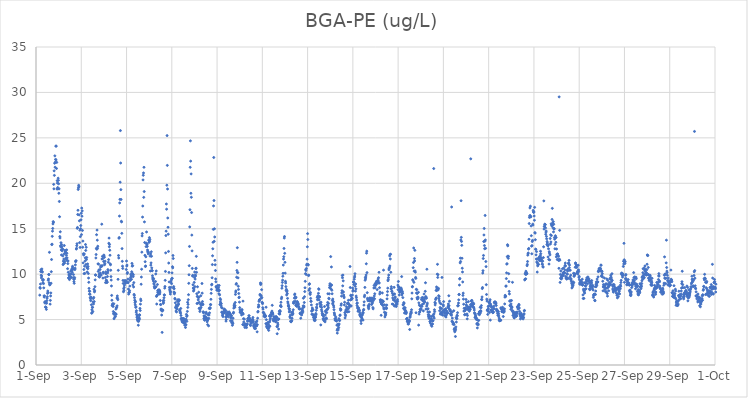
| Category | BGA-PE (ug/L) |
|---|---|
| 44440.166666666664 | 7.69 |
| 44440.177083333336 | 8.53 |
| 44440.1875 | 8.44 |
| 44440.197916666664 | 8.91 |
| 44440.208333333336 | 10.28 |
| 44440.21875 | 10.49 |
| 44440.229166666664 | 9.88 |
| 44440.239583333336 | 9.59 |
| 44440.25 | 9.79 |
| 44440.260416666664 | 10.57 |
| 44440.270833333336 | 10.29 |
| 44440.28125 | 10.23 |
| 44440.291666666664 | 9.36 |
| 44440.302083333336 | 9.04 |
| 44440.3125 | 9.31 |
| 44440.322916666664 | 9.4 |
| 44440.333333333336 | 8.96 |
| 44440.34375 | 8.49 |
| 44440.354166666664 | 7.6 |
| 44440.364583333336 | 7.47 |
| 44440.375 | 7.6 |
| 44440.385416666664 | 6.91 |
| 44440.395833333336 | 6.82 |
| 44440.40625 | 6.97 |
| 44440.416666666664 | 6.38 |
| 44440.427083333336 | 6.36 |
| 44440.4375 | 6.83 |
| 44440.447916666664 | 6.34 |
| 44440.458333333336 | 6.12 |
| 44440.46875 | 6.8 |
| 44440.479166666664 | 7.08 |
| 44440.489583333336 | 7.35 |
| 44440.5 | 7.52 |
| 44440.510416666664 | 7.88 |
| 44440.520833333336 | 8.14 |
| 44440.53125 | 7.98 |
| 44440.541666666664 | 9.32 |
| 44440.552083333336 | 9.47 |
| 44440.5625 | 9.96 |
| 44440.572916666664 | 9.95 |
| 44440.583333333336 | 9.05 |
| 44440.59375 | 12.4 |
| 44440.604166666664 | 8.84 |
| 44440.614583333336 | 8.82 |
| 44440.625 | 6.7 |
| 44440.635416666664 | 7.11 |
| 44440.645833333336 | 7.6 |
| 44440.65625 | 7.93 |
| 44440.666666666664 | 9 |
| 44440.677083333336 | 10.27 |
| 44440.6875 | 11.61 |
| 44440.697916666664 | 13.25 |
| 44440.708333333336 | 13.3 |
| 44440.71875 | 14.16 |
| 44440.729166666664 | 14.73 |
| 44440.739583333336 | 15.03 |
| 44440.75 | 15.53 |
| 44440.760416666664 | 15.78 |
| 44440.770833333336 | 15.7 |
| 44440.78125 | 19.88 |
| 44440.791666666664 | 19.39 |
| 44440.802083333336 | 21.37 |
| 44440.8125 | 20.87 |
| 44440.822916666664 | 22.21 |
| 44440.833333333336 | 23.02 |
| 44440.84375 | 21.77 |
| 44440.854166666664 | 22.32 |
| 44440.864583333336 | 22.63 |
| 44440.875 | 24.09 |
| 44440.885416666664 | 22.57 |
| 44440.895833333336 | 24.09 |
| 44440.90625 | 21.63 |
| 44440.916666666664 | 22.3 |
| 44440.927083333336 | 19.37 |
| 44440.9375 | 20.29 |
| 44440.947916666664 | 20.02 |
| 44440.958333333336 | 19.53 |
| 44440.96875 | 19.38 |
| 44440.979166666664 | 20.56 |
| 44440.989583333336 | 20.32 |
| 44441.0 | 19.95 |
| 44441.010416666664 | 18.9 |
| 44441.020833333336 | 19.39 |
| 44441.03125 | 18 |
| 44441.041666666664 | 16.32 |
| 44441.052083333336 | 14.14 |
| 44441.0625 | 13.98 |
| 44441.072916666664 | 14.66 |
| 44441.083333333336 | 13.12 |
| 44441.09375 | 13 |
| 44441.104166666664 | 13.46 |
| 44441.114583333336 | 12.66 |
| 44441.125 | 12.11 |
| 44441.135416666664 | 13.25 |
| 44441.145833333336 | 13.01 |
| 44441.15625 | 12.57 |
| 44441.166666666664 | 12.74 |
| 44441.177083333336 | 12.76 |
| 44441.1875 | 12.01 |
| 44441.197916666664 | 11.05 |
| 44441.208333333336 | 11.43 |
| 44441.21875 | 11.17 |
| 44441.229166666664 | 11.66 |
| 44441.239583333336 | 12.23 |
| 44441.25 | 13.15 |
| 44441.260416666664 | 11.21 |
| 44441.270833333336 | 11.4 |
| 44441.28125 | 12.63 |
| 44441.291666666664 | 12.46 |
| 44441.302083333336 | 12.45 |
| 44441.3125 | 12.3 |
| 44441.322916666664 | 11.78 |
| 44441.333333333336 | 11.62 |
| 44441.34375 | 12.07 |
| 44441.354166666664 | 12.67 |
| 44441.364583333336 | 12.3 |
| 44441.375 | 11.79 |
| 44441.385416666664 | 11.48 |
| 44441.395833333336 | 10.6 |
| 44441.40625 | 11.16 |
| 44441.416666666664 | 11.45 |
| 44441.427083333336 | 10.2 |
| 44441.4375 | 9.57 |
| 44441.447916666664 | 9.61 |
| 44441.458333333336 | 9.93 |
| 44441.46875 | 9.83 |
| 44441.479166666664 | 9.4 |
| 44441.489583333336 | 9.99 |
| 44441.5 | 9.75 |
| 44441.510416666664 | 9.69 |
| 44441.520833333336 | 9.63 |
| 44441.53125 | 10.33 |
| 44441.541666666664 | 10 |
| 44441.552083333336 | 10.02 |
| 44441.5625 | 9.63 |
| 44441.572916666664 | 10.46 |
| 44441.583333333336 | 10.38 |
| 44441.59375 | 10.61 |
| 44441.604166666664 | 10.21 |
| 44441.614583333336 | 10.86 |
| 44441.625 | 10.71 |
| 44441.635416666664 | 10.54 |
| 44441.645833333336 | 9.62 |
| 44441.65625 | 9.95 |
| 44441.666666666664 | 9.44 |
| 44441.677083333336 | 9.18 |
| 44441.6875 | 8.99 |
| 44441.697916666664 | 9.47 |
| 44441.708333333336 | 9.62 |
| 44441.71875 | 10.5 |
| 44441.729166666664 | 10.66 |
| 44441.739583333336 | 11.02 |
| 44441.75 | 11.37 |
| 44441.760416666664 | 11.46 |
| 44441.770833333336 | 11.47 |
| 44441.78125 | 12.76 |
| 44441.791666666664 | 12.84 |
| 44441.802083333336 | 13.13 |
| 44441.8125 | 13.35 |
| 44441.822916666664 | 15.04 |
| 44441.833333333336 | 15.14 |
| 44441.84375 | 16.57 |
| 44441.854166666664 | 17.03 |
| 44441.864583333336 | 19.32 |
| 44441.875 | 19.5 |
| 44441.885416666664 | 19.78 |
| 44441.895833333336 | 19.62 |
| 44441.90625 | 16.52 |
| 44441.916666666664 | 15.87 |
| 44441.927083333336 | 13.47 |
| 44441.9375 | 14.84 |
| 44441.947916666664 | 12.94 |
| 44441.958333333336 | 14.13 |
| 44441.96875 | 15 |
| 44441.979166666664 | 15.35 |
| 44441.989583333336 | 15.98 |
| 44442.0 | 16.7 |
| 44442.010416666664 | 14.35 |
| 44442.020833333336 | 17.27 |
| 44442.03125 | 16.38 |
| 44442.041666666664 | 16.96 |
| 44442.052083333336 | 14.81 |
| 44442.0625 | 12.96 |
| 44442.072916666664 | 13.64 |
| 44442.083333333336 | 11.24 |
| 44442.09375 | 12.25 |
| 44442.104166666664 | 12.11 |
| 44442.114583333336 | 10.51 |
| 44442.125 | 10.06 |
| 44442.135416666664 | 12.22 |
| 44442.145833333336 | 10.88 |
| 44442.15625 | 10.08 |
| 44442.166666666664 | 11.44 |
| 44442.177083333336 | 11.8 |
| 44442.1875 | 13.26 |
| 44442.197916666664 | 12.61 |
| 44442.208333333336 | 11.06 |
| 44442.21875 | 12.96 |
| 44442.229166666664 | 11.61 |
| 44442.239583333336 | 11.83 |
| 44442.25 | 10.71 |
| 44442.260416666664 | 10.24 |
| 44442.270833333336 | 10.79 |
| 44442.28125 | 11.12 |
| 44442.291666666664 | 10.6 |
| 44442.302083333336 | 10.84 |
| 44442.3125 | 10.07 |
| 44442.322916666664 | 9.57 |
| 44442.333333333336 | 9.1 |
| 44442.34375 | 8.43 |
| 44442.354166666664 | 8.13 |
| 44442.364583333336 | 7.8 |
| 44442.375 | 8.11 |
| 44442.385416666664 | 7.79 |
| 44442.395833333336 | 7.43 |
| 44442.40625 | 7.3 |
| 44442.416666666664 | 7.08 |
| 44442.427083333336 | 7.48 |
| 44442.4375 | 7.36 |
| 44442.447916666664 | 6.63 |
| 44442.458333333336 | 5.7 |
| 44442.46875 | 6.08 |
| 44442.479166666664 | 5.75 |
| 44442.489583333336 | 6.35 |
| 44442.5 | 6.34 |
| 44442.510416666664 | 5.89 |
| 44442.520833333336 | 6.94 |
| 44442.53125 | 7.31 |
| 44442.541666666664 | 6.72 |
| 44442.552083333336 | 7.44 |
| 44442.5625 | 8.34 |
| 44442.572916666664 | 6.98 |
| 44442.583333333336 | 8.05 |
| 44442.59375 | 8.16 |
| 44442.604166666664 | 8.62 |
| 44442.614583333336 | 9.37 |
| 44442.625 | 9.91 |
| 44442.635416666664 | 9.89 |
| 44442.645833333336 | 11.78 |
| 44442.65625 | 12.16 |
| 44442.666666666664 | 12.84 |
| 44442.677083333336 | 14.34 |
| 44442.6875 | 12.74 |
| 44442.697916666664 | 14.85 |
| 44442.708333333336 | 13.74 |
| 44442.71875 | 12.85 |
| 44442.729166666664 | 13.07 |
| 44442.739583333336 | 11.13 |
| 44442.75 | 10.3 |
| 44442.760416666664 | 11.11 |
| 44442.770833333336 | 9.75 |
| 44442.78125 | 10.47 |
| 44442.791666666664 | 10.01 |
| 44442.802083333336 | 9.67 |
| 44442.8125 | 9.75 |
| 44442.822916666664 | 9.96 |
| 44442.833333333336 | 10.51 |
| 44442.84375 | 10.12 |
| 44442.854166666664 | 10.78 |
| 44442.864583333336 | 10.91 |
| 44442.875 | 10.91 |
| 44442.885416666664 | 9.91 |
| 44442.895833333336 | 10.85 |
| 44442.90625 | 15.5 |
| 44442.916666666664 | 11.67 |
| 44442.927083333336 | 10.93 |
| 44442.9375 | 11.96 |
| 44442.947916666664 | 11.71 |
| 44442.958333333336 | 9.57 |
| 44442.96875 | 10.21 |
| 44442.979166666664 | 10.12 |
| 44442.989583333336 | 11.39 |
| 44443.0 | 12.1 |
| 44443.010416666664 | 11.99 |
| 44443.020833333336 | 11.85 |
| 44443.03125 | 11.04 |
| 44443.041666666664 | 11.17 |
| 44443.052083333336 | 11.43 |
| 44443.0625 | 9.63 |
| 44443.072916666664 | 9.07 |
| 44443.083333333336 | 10.25 |
| 44443.09375 | 10.04 |
| 44443.104166666664 | 9.32 |
| 44443.114583333336 | 9.32 |
| 44443.125 | 9.08 |
| 44443.135416666664 | 9.15 |
| 44443.145833333336 | 9.11 |
| 44443.15625 | 9.74 |
| 44443.166666666664 | 10.14 |
| 44443.177083333336 | 10.5 |
| 44443.1875 | 10.35 |
| 44443.197916666664 | 11.31 |
| 44443.208333333336 | 11.6 |
| 44443.21875 | 13.4 |
| 44443.229166666664 | 13.97 |
| 44443.239583333336 | 13.01 |
| 44443.25 | 13.26 |
| 44443.260416666664 | 12.63 |
| 44443.270833333336 | 12.08 |
| 44443.28125 | 11.12 |
| 44443.291666666664 | 11.03 |
| 44443.302083333336 | 10.43 |
| 44443.3125 | 9.73 |
| 44443.322916666664 | 9.35 |
| 44443.333333333336 | 8.7 |
| 44443.34375 | 7.66 |
| 44443.354166666664 | 7.13 |
| 44443.364583333336 | 6.58 |
| 44443.375 | 6.56 |
| 44443.385416666664 | 6.74 |
| 44443.395833333336 | 6.49 |
| 44443.40625 | 6.45 |
| 44443.416666666664 | 5.88 |
| 44443.427083333336 | 5.65 |
| 44443.4375 | 6.74 |
| 44443.447916666664 | 5.09 |
| 44443.458333333336 | 5.57 |
| 44443.46875 | 5.75 |
| 44443.479166666664 | 5.26 |
| 44443.489583333336 | 5.61 |
| 44443.5 | 5.66 |
| 44443.510416666664 | 5.35 |
| 44443.520833333336 | 5.63 |
| 44443.53125 | 6.15 |
| 44443.541666666664 | 5.59 |
| 44443.552083333336 | 6.31 |
| 44443.5625 | 6.33 |
| 44443.572916666664 | 7.37 |
| 44443.583333333336 | 6.51 |
| 44443.59375 | 7.6 |
| 44443.604166666664 | 7.35 |
| 44443.614583333336 | 7.19 |
| 44443.625 | 9.43 |
| 44443.635416666664 | 10.42 |
| 44443.645833333336 | 12.05 |
| 44443.65625 | 11.78 |
| 44443.666666666664 | 13.95 |
| 44443.677083333336 | 14.03 |
| 44443.6875 | 16.39 |
| 44443.697916666664 | 17.84 |
| 44443.708333333336 | 18.23 |
| 44443.71875 | 20.12 |
| 44443.729166666664 | 25.8 |
| 44443.739583333336 | 22.23 |
| 44443.75 | 19.3 |
| 44443.760416666664 | 18.22 |
| 44443.770833333336 | 15.82 |
| 44443.78125 | 15.75 |
| 44443.791666666664 | 14.49 |
| 44443.802083333336 | 12.81 |
| 44443.8125 | 11.41 |
| 44443.822916666664 | 10.88 |
| 44443.833333333336 | 10.63 |
| 44443.84375 | 9.31 |
| 44443.854166666664 | 8.98 |
| 44443.864583333336 | 8.06 |
| 44443.875 | 8.39 |
| 44443.885416666664 | 8.19 |
| 44443.895833333336 | 8.56 |
| 44443.90625 | 8.79 |
| 44443.916666666664 | 9.22 |
| 44443.927083333336 | 9.27 |
| 44443.9375 | 9.28 |
| 44443.947916666664 | 9.03 |
| 44443.958333333336 | 9.01 |
| 44443.96875 | 9.21 |
| 44443.979166666664 | 9.27 |
| 44443.989583333336 | 10.51 |
| 44444.0 | 11.44 |
| 44444.010416666664 | 10.89 |
| 44444.020833333336 | 11 |
| 44444.03125 | 10.07 |
| 44444.041666666664 | 10.19 |
| 44444.052083333336 | 9.1 |
| 44444.0625 | 9.46 |
| 44444.072916666664 | 9.05 |
| 44444.083333333336 | 8.36 |
| 44444.09375 | 7.8 |
| 44444.104166666664 | 7.97 |
| 44444.114583333336 | 7.95 |
| 44444.125 | 8.01 |
| 44444.135416666664 | 8.18 |
| 44444.145833333336 | 8.68 |
| 44444.15625 | 9.29 |
| 44444.166666666664 | 9.41 |
| 44444.177083333336 | 9.6 |
| 44444.1875 | 10 |
| 44444.197916666664 | 9.79 |
| 44444.208333333336 | 9.79 |
| 44444.21875 | 9.43 |
| 44444.229166666664 | 10.26 |
| 44444.239583333336 | 11.18 |
| 44444.25 | 10.88 |
| 44444.260416666664 | 10.08 |
| 44444.270833333336 | 10.94 |
| 44444.28125 | 8.81 |
| 44444.291666666664 | 9.73 |
| 44444.302083333336 | 9.93 |
| 44444.3125 | 8.59 |
| 44444.322916666664 | 9.07 |
| 44444.333333333336 | 7.77 |
| 44444.34375 | 7.66 |
| 44444.354166666664 | 7.41 |
| 44444.364583333336 | 7.13 |
| 44444.375 | 6.86 |
| 44444.385416666664 | 6.62 |
| 44444.395833333336 | 6.98 |
| 44444.40625 | 6.34 |
| 44444.416666666664 | 6.41 |
| 44444.427083333336 | 5.82 |
| 44444.4375 | 5.98 |
| 44444.447916666664 | 5.58 |
| 44444.458333333336 | 5.26 |
| 44444.46875 | 5.42 |
| 44444.479166666664 | 5.04 |
| 44444.489583333336 | 4.93 |
| 44444.5 | 4.84 |
| 44444.510416666664 | 5.03 |
| 44444.520833333336 | 4.38 |
| 44444.53125 | 4.8 |
| 44444.541666666664 | 4.93 |
| 44444.552083333336 | 5.25 |
| 44444.5625 | 5.52 |
| 44444.572916666664 | 5.07 |
| 44444.583333333336 | 5.5 |
| 44444.59375 | 6.23 |
| 44444.604166666664 | 6 |
| 44444.614583333336 | 6.7 |
| 44444.625 | 7.25 |
| 44444.635416666664 | 7.08 |
| 44444.645833333336 | 8.89 |
| 44444.65625 | 9.68 |
| 44444.666666666664 | 10.54 |
| 44444.677083333336 | 12.42 |
| 44444.6875 | 14.21 |
| 44444.697916666664 | 14.47 |
| 44444.708333333336 | 16.28 |
| 44444.71875 | 17.5 |
| 44444.729166666664 | 20.37 |
| 44444.739583333336 | 20.88 |
| 44444.75 | 21.14 |
| 44444.760416666664 | 18.45 |
| 44444.770833333336 | 21.76 |
| 44444.78125 | 19.09 |
| 44444.791666666664 | 15.75 |
| 44444.802083333336 | 13.48 |
| 44444.8125 | 12.07 |
| 44444.822916666664 | 11.37 |
| 44444.833333333336 | 10.84 |
| 44444.84375 | 10.9 |
| 44444.854166666664 | 11.91 |
| 44444.864583333336 | 13.03 |
| 44444.875 | 13.41 |
| 44444.885416666664 | 14.64 |
| 44444.895833333336 | 13.31 |
| 44444.90625 | 13.23 |
| 44444.916666666664 | 13.05 |
| 44444.927083333336 | 12.66 |
| 44444.9375 | 12.44 |
| 44444.947916666664 | 12.49 |
| 44444.958333333336 | 12.23 |
| 44444.96875 | 12.38 |
| 44444.979166666664 | 13.75 |
| 44444.989583333336 | 13.49 |
| 44445.0 | 13.69 |
| 44445.010416666664 | 14.02 |
| 44445.020833333336 | 13.6 |
| 44445.03125 | 13.83 |
| 44445.041666666664 | 11.98 |
| 44445.052083333336 | 10.35 |
| 44445.0625 | 12.22 |
| 44445.072916666664 | 10.99 |
| 44445.083333333336 | 11.24 |
| 44445.09375 | 12.46 |
| 44445.104166666664 | 11.97 |
| 44445.114583333336 | 10.69 |
| 44445.125 | 10.39 |
| 44445.135416666664 | 10.37 |
| 44445.145833333336 | 9.82 |
| 44445.15625 | 9.59 |
| 44445.166666666664 | 9.4 |
| 44445.177083333336 | 9.54 |
| 44445.1875 | 9.24 |
| 44445.197916666664 | 9.49 |
| 44445.208333333336 | 8.99 |
| 44445.21875 | 8.89 |
| 44445.229166666664 | 8.64 |
| 44445.239583333336 | 8.47 |
| 44445.25 | 8.58 |
| 44445.260416666664 | 8.5 |
| 44445.270833333336 | 8.56 |
| 44445.28125 | 9.19 |
| 44445.291666666664 | 10.02 |
| 44445.302083333336 | 8.62 |
| 44445.3125 | 10.35 |
| 44445.322916666664 | 7.55 |
| 44445.333333333336 | 6.71 |
| 44445.34375 | 7.63 |
| 44445.354166666664 | 7.7 |
| 44445.364583333336 | 8.86 |
| 44445.375 | 8.17 |
| 44445.385416666664 | 7.98 |
| 44445.395833333336 | 8.01 |
| 44445.40625 | 8.26 |
| 44445.416666666664 | 8.02 |
| 44445.427083333336 | 7.82 |
| 44445.4375 | 8.25 |
| 44445.447916666664 | 8.24 |
| 44445.458333333336 | 8.18 |
| 44445.46875 | 7.82 |
| 44445.479166666664 | 8.03 |
| 44445.489583333336 | 7.1 |
| 44445.5 | 6.66 |
| 44445.510416666664 | 6.65 |
| 44445.520833333336 | 6.15 |
| 44445.53125 | 6.04 |
| 44445.541666666664 | 6.13 |
| 44445.552083333336 | 5.5 |
| 44445.5625 | 5.96 |
| 44445.572916666664 | 3.59 |
| 44445.583333333336 | 5.95 |
| 44445.59375 | 6.04 |
| 44445.604166666664 | 6.04 |
| 44445.614583333336 | 7.08 |
| 44445.625 | 6.78 |
| 44445.635416666664 | 6.91 |
| 44445.645833333336 | 7.11 |
| 44445.65625 | 7.4 |
| 44445.666666666664 | 7.72 |
| 44445.677083333336 | 7.69 |
| 44445.6875 | 8.46 |
| 44445.697916666664 | 8.64 |
| 44445.708333333336 | 9.32 |
| 44445.71875 | 10.3 |
| 44445.729166666664 | 12.34 |
| 44445.739583333336 | 14.25 |
| 44445.75 | 14.73 |
| 44445.760416666664 | 17.72 |
| 44445.770833333336 | 17.15 |
| 44445.78125 | 19.79 |
| 44445.791666666664 | 25.25 |
| 44445.802083333336 | 21.97 |
| 44445.8125 | 19.37 |
| 44445.822916666664 | 16.18 |
| 44445.833333333336 | 15.16 |
| 44445.84375 | 14.4 |
| 44445.854166666664 | 12.5 |
| 44445.864583333336 | 11.22 |
| 44445.875 | 10.19 |
| 44445.885416666664 | 9.14 |
| 44445.895833333336 | 8.54 |
| 44445.90625 | 8.34 |
| 44445.916666666664 | 8.18 |
| 44445.927083333336 | 8.04 |
| 44445.9375 | 7.81 |
| 44445.947916666664 | 8.04 |
| 44445.958333333336 | 8.54 |
| 44445.96875 | 9.13 |
| 44445.979166666664 | 9.35 |
| 44445.989583333336 | 8.95 |
| 44446.0 | 9.52 |
| 44446.010416666664 | 10.14 |
| 44446.020833333336 | 9.54 |
| 44446.03125 | 10.82 |
| 44446.041666666664 | 10.69 |
| 44446.052083333336 | 12.05 |
| 44446.0625 | 11.72 |
| 44446.072916666664 | 8.48 |
| 44446.083333333336 | 8.63 |
| 44446.09375 | 8.03 |
| 44446.104166666664 | 8.4 |
| 44446.114583333336 | 7.83 |
| 44446.125 | 7.95 |
| 44446.135416666664 | 7.33 |
| 44446.145833333336 | 7.25 |
| 44446.15625 | 6.85 |
| 44446.166666666664 | 6.31 |
| 44446.177083333336 | 6.39 |
| 44446.1875 | 5.94 |
| 44446.197916666664 | 6.59 |
| 44446.208333333336 | 5.84 |
| 44446.21875 | 6.18 |
| 44446.229166666664 | 6.19 |
| 44446.239583333336 | 6.43 |
| 44446.25 | 7.03 |
| 44446.260416666664 | 7.17 |
| 44446.270833333336 | 6.59 |
| 44446.28125 | 6.66 |
| 44446.291666666664 | 6.96 |
| 44446.302083333336 | 6.71 |
| 44446.3125 | 7.19 |
| 44446.322916666664 | 7.14 |
| 44446.333333333336 | 7.1 |
| 44446.34375 | 6.06 |
| 44446.354166666664 | 5.98 |
| 44446.364583333336 | 5.85 |
| 44446.375 | 5.81 |
| 44446.385416666664 | 5.69 |
| 44446.395833333336 | 6.22 |
| 44446.40625 | 5.45 |
| 44446.416666666664 | 5.12 |
| 44446.427083333336 | 5.11 |
| 44446.4375 | 4.96 |
| 44446.447916666664 | 4.84 |
| 44446.458333333336 | 5.07 |
| 44446.46875 | 4.71 |
| 44446.479166666664 | 4.83 |
| 44446.489583333336 | 5.13 |
| 44446.5 | 4.74 |
| 44446.510416666664 | 4.93 |
| 44446.520833333336 | 5.07 |
| 44446.53125 | 4.65 |
| 44446.541666666664 | 5.09 |
| 44446.552083333336 | 4.66 |
| 44446.5625 | 4.56 |
| 44446.572916666664 | 4.38 |
| 44446.583333333336 | 4.9 |
| 44446.59375 | 4.74 |
| 44446.604166666664 | 4.13 |
| 44446.614583333336 | 4.46 |
| 44446.625 | 4.41 |
| 44446.635416666664 | 5.03 |
| 44446.645833333336 | 5.57 |
| 44446.65625 | 5.34 |
| 44446.666666666664 | 4.81 |
| 44446.677083333336 | 5.42 |
| 44446.6875 | 5.9 |
| 44446.697916666664 | 6.9 |
| 44446.708333333336 | 6.34 |
| 44446.71875 | 6.67 |
| 44446.729166666664 | 7.19 |
| 44446.739583333336 | 7.74 |
| 44446.75 | 8.99 |
| 44446.760416666664 | 9.93 |
| 44446.770833333336 | 10.93 |
| 44446.78125 | 13.05 |
| 44446.791666666664 | 15.2 |
| 44446.802083333336 | 17.09 |
| 44446.8125 | 21.76 |
| 44446.822916666664 | 24.67 |
| 44446.833333333336 | 22.44 |
| 44446.84375 | 18.9 |
| 44446.854166666664 | 21.03 |
| 44446.864583333336 | 18.46 |
| 44446.875 | 16.78 |
| 44446.885416666664 | 14.3 |
| 44446.895833333336 | 12.56 |
| 44446.90625 | 10.63 |
| 44446.916666666664 | 9.79 |
| 44446.927083333336 | 9.87 |
| 44446.9375 | 8.83 |
| 44446.947916666664 | 8.47 |
| 44446.958333333336 | 8.14 |
| 44446.96875 | 8.42 |
| 44446.979166666664 | 8.26 |
| 44446.989583333336 | 9.09 |
| 44447.0 | 9.64 |
| 44447.010416666664 | 10.23 |
| 44447.020833333336 | 8.63 |
| 44447.03125 | 9.46 |
| 44447.041666666664 | 9.91 |
| 44447.052083333336 | 9.8 |
| 44447.0625 | 10.61 |
| 44447.072916666664 | 10.66 |
| 44447.083333333336 | 11.96 |
| 44447.09375 | 10.2 |
| 44447.104166666664 | 7.84 |
| 44447.114583333336 | 6.77 |
| 44447.125 | 7.55 |
| 44447.135416666664 | 8.61 |
| 44447.145833333336 | 7.52 |
| 44447.15625 | 6.81 |
| 44447.166666666664 | 7.17 |
| 44447.177083333336 | 7.41 |
| 44447.1875 | 8.01 |
| 44447.197916666664 | 7.47 |
| 44447.208333333336 | 6.23 |
| 44447.21875 | 6.9 |
| 44447.229166666664 | 6.25 |
| 44447.239583333336 | 5.89 |
| 44447.25 | 6.07 |
| 44447.260416666664 | 6.26 |
| 44447.270833333336 | 6.66 |
| 44447.28125 | 7.62 |
| 44447.291666666664 | 6.34 |
| 44447.302083333336 | 6.72 |
| 44447.3125 | 6.63 |
| 44447.322916666664 | 6.76 |
| 44447.333333333336 | 8.97 |
| 44447.34375 | 7.91 |
| 44447.354166666664 | 6.98 |
| 44447.364583333336 | 6.64 |
| 44447.375 | 6.69 |
| 44447.385416666664 | 5.86 |
| 44447.395833333336 | 5.77 |
| 44447.40625 | 5.78 |
| 44447.416666666664 | 5.12 |
| 44447.427083333336 | 5.42 |
| 44447.4375 | 5.35 |
| 44447.447916666664 | 4.94 |
| 44447.458333333336 | 4.95 |
| 44447.46875 | 5.25 |
| 44447.479166666664 | 5.19 |
| 44447.489583333336 | 5.04 |
| 44447.5 | 5.32 |
| 44447.510416666664 | 5.66 |
| 44447.520833333336 | 5.8 |
| 44447.53125 | 5.19 |
| 44447.541666666664 | 5.12 |
| 44447.552083333336 | 5.05 |
| 44447.5625 | 4.75 |
| 44447.572916666664 | 4.89 |
| 44447.583333333336 | 4.44 |
| 44447.59375 | 4.99 |
| 44447.604166666664 | 5.57 |
| 44447.614583333336 | 5.53 |
| 44447.625 | 4.31 |
| 44447.635416666664 | 5.13 |
| 44447.645833333336 | 5.5 |
| 44447.65625 | 6.22 |
| 44447.666666666664 | 5.74 |
| 44447.677083333336 | 6.29 |
| 44447.6875 | 6.21 |
| 44447.697916666664 | 6.29 |
| 44447.708333333336 | 6.66 |
| 44447.71875 | 6.64 |
| 44447.729166666664 | 7.23 |
| 44447.739583333336 | 7.89 |
| 44447.75 | 8.32 |
| 44447.760416666664 | 8.82 |
| 44447.770833333336 | 8.89 |
| 44447.78125 | 9.6 |
| 44447.791666666664 | 11.05 |
| 44447.802083333336 | 12.02 |
| 44447.8125 | 12.79 |
| 44447.822916666664 | 13.51 |
| 44447.833333333336 | 14.93 |
| 44447.84375 | 17.51 |
| 44447.854166666664 | 22.84 |
| 44447.864583333336 | 18.1 |
| 44447.875 | 13.61 |
| 44447.885416666664 | 14.99 |
| 44447.895833333336 | 14.09 |
| 44447.90625 | 11.52 |
| 44447.916666666664 | 11.03 |
| 44447.927083333336 | 10.4 |
| 44447.9375 | 9.47 |
| 44447.947916666664 | 9.16 |
| 44447.958333333336 | 8.64 |
| 44447.96875 | 8.54 |
| 44447.979166666664 | 8.61 |
| 44447.989583333336 | 8.24 |
| 44448.0 | 8.25 |
| 44448.010416666664 | 8.4 |
| 44448.020833333336 | 8.41 |
| 44448.03125 | 8.76 |
| 44448.041666666664 | 8.21 |
| 44448.052083333336 | 8.29 |
| 44448.0625 | 8.5 |
| 44448.072916666664 | 8.18 |
| 44448.083333333336 | 7.84 |
| 44448.09375 | 8.75 |
| 44448.104166666664 | 8.21 |
| 44448.114583333336 | 7.72 |
| 44448.125 | 6.66 |
| 44448.135416666664 | 7.31 |
| 44448.145833333336 | 6.94 |
| 44448.15625 | 7.18 |
| 44448.166666666664 | 6.81 |
| 44448.177083333336 | 6.53 |
| 44448.1875 | 6.75 |
| 44448.197916666664 | 6.32 |
| 44448.208333333336 | 5.82 |
| 44448.21875 | 5.8 |
| 44448.229166666664 | 6.27 |
| 44448.239583333336 | 5.47 |
| 44448.25 | 5.61 |
| 44448.260416666664 | 5.33 |
| 44448.270833333336 | 5.69 |
| 44448.28125 | 5.67 |
| 44448.291666666664 | 5.83 |
| 44448.302083333336 | 5.76 |
| 44448.3125 | 5.98 |
| 44448.322916666664 | 6.15 |
| 44448.333333333336 | 6.1 |
| 44448.34375 | 5.75 |
| 44448.354166666664 | 5.83 |
| 44448.364583333336 | 5.95 |
| 44448.375 | 6.01 |
| 44448.385416666664 | 5.28 |
| 44448.395833333336 | 4.83 |
| 44448.40625 | 5.01 |
| 44448.416666666664 | 5.56 |
| 44448.427083333336 | 5.32 |
| 44448.4375 | 5.45 |
| 44448.447916666664 | 5.41 |
| 44448.458333333336 | 5.82 |
| 44448.46875 | 5.69 |
| 44448.479166666664 | 5.76 |
| 44448.489583333336 | 5.67 |
| 44448.5 | 5.59 |
| 44448.510416666664 | 5.3 |
| 44448.520833333336 | 5.67 |
| 44448.53125 | 5.85 |
| 44448.541666666664 | 5.6 |
| 44448.552083333336 | 5.67 |
| 44448.5625 | 5.69 |
| 44448.572916666664 | 5.66 |
| 44448.583333333336 | 5.51 |
| 44448.59375 | 4.86 |
| 44448.604166666664 | 5.18 |
| 44448.614583333336 | 5.47 |
| 44448.625 | 5.29 |
| 44448.635416666664 | 5.43 |
| 44448.645833333336 | 4.65 |
| 44448.65625 | 4.89 |
| 44448.666666666664 | 4.76 |
| 44448.677083333336 | 4.37 |
| 44448.6875 | 4.65 |
| 44448.697916666664 | 4.55 |
| 44448.708333333336 | 5.15 |
| 44448.71875 | 5.7 |
| 44448.729166666664 | 5.8 |
| 44448.739583333336 | 6.26 |
| 44448.75 | 6.51 |
| 44448.760416666664 | 6.7 |
| 44448.770833333336 | 6.42 |
| 44448.78125 | 6.35 |
| 44448.791666666664 | 6.53 |
| 44448.802083333336 | 6.88 |
| 44448.8125 | 7.77 |
| 44448.822916666664 | 8.03 |
| 44448.833333333336 | 8.16 |
| 44448.84375 | 8.88 |
| 44448.854166666664 | 8.97 |
| 44448.864583333336 | 9.66 |
| 44448.875 | 10.4 |
| 44448.885416666664 | 11.3 |
| 44448.895833333336 | 12.91 |
| 44448.90625 | 10.17 |
| 44448.916666666664 | 10.17 |
| 44448.927083333336 | 9.59 |
| 44448.9375 | 8.67 |
| 44448.947916666664 | 8.32 |
| 44448.958333333336 | 7.87 |
| 44448.96875 | 7.41 |
| 44448.979166666664 | 7.47 |
| 44448.989583333336 | 6.92 |
| 44449.0 | 6.31 |
| 44449.010416666664 | 6.07 |
| 44449.020833333336 | 5.79 |
| 44449.03125 | 5.88 |
| 44449.041666666664 | 5.78 |
| 44449.052083333336 | 5.81 |
| 44449.0625 | 5.9 |
| 44449.072916666664 | 5.94 |
| 44449.083333333336 | 5.51 |
| 44449.09375 | 6.03 |
| 44449.104166666664 | 6.1 |
| 44449.114583333336 | 5.76 |
| 44449.125 | 5.68 |
| 44449.135416666664 | 4.45 |
| 44449.145833333336 | 7.03 |
| 44449.15625 | 5.61 |
| 44449.166666666664 | 5.1 |
| 44449.177083333336 | 4.73 |
| 44449.1875 | 4.37 |
| 44449.197916666664 | 4.46 |
| 44449.208333333336 | 5.05 |
| 44449.21875 | 4.4 |
| 44449.229166666664 | 4.13 |
| 44449.239583333336 | 4.53 |
| 44449.25 | 4.45 |
| 44449.260416666664 | 4.46 |
| 44449.270833333336 | 4.4 |
| 44449.28125 | 4.38 |
| 44449.291666666664 | 4.31 |
| 44449.302083333336 | 4.12 |
| 44449.3125 | 4.45 |
| 44449.322916666664 | 4.52 |
| 44449.333333333336 | 4.51 |
| 44449.34375 | 4.83 |
| 44449.354166666664 | 5.1 |
| 44449.364583333336 | 4.9 |
| 44449.375 | 5.06 |
| 44449.385416666664 | 5.18 |
| 44449.395833333336 | 4.85 |
| 44449.40625 | 5.42 |
| 44449.416666666664 | 5.42 |
| 44449.427083333336 | 4.89 |
| 44449.4375 | 5.16 |
| 44449.447916666664 | 5.03 |
| 44449.458333333336 | 4.84 |
| 44449.46875 | 4.43 |
| 44449.479166666664 | 4.34 |
| 44449.489583333336 | 4.62 |
| 44449.5 | 4.75 |
| 44449.510416666664 | 4.89 |
| 44449.520833333336 | 4.68 |
| 44449.53125 | 4.76 |
| 44449.541666666664 | 4.68 |
| 44449.552083333336 | 4.87 |
| 44449.5625 | 5.04 |
| 44449.572916666664 | 4.75 |
| 44449.583333333336 | 5.23 |
| 44449.59375 | 4.94 |
| 44449.604166666664 | 4.77 |
| 44449.614583333336 | 4.35 |
| 44449.625 | 4.21 |
| 44449.635416666664 | 4.47 |
| 44449.645833333336 | 4.43 |
| 44449.65625 | 4.02 |
| 44449.666666666664 | 4.15 |
| 44449.677083333336 | 4.39 |
| 44449.6875 | 4.27 |
| 44449.697916666664 | 4.01 |
| 44449.708333333336 | 4.64 |
| 44449.71875 | 4.32 |
| 44449.729166666664 | 4.35 |
| 44449.739583333336 | 4.75 |
| 44449.75 | 4.3 |
| 44449.760416666664 | 4.84 |
| 44449.770833333336 | 3.65 |
| 44449.78125 | 4.44 |
| 44449.791666666664 | 5.15 |
| 44449.802083333336 | 5.83 |
| 44449.8125 | 5.9 |
| 44449.822916666664 | 6.37 |
| 44449.833333333336 | 6.62 |
| 44449.84375 | 6.46 |
| 44449.854166666664 | 7 |
| 44449.864583333336 | 7.13 |
| 44449.875 | 7.11 |
| 44449.885416666664 | 7.22 |
| 44449.895833333336 | 7.77 |
| 44449.90625 | 7.66 |
| 44449.916666666664 | 9.03 |
| 44449.927083333336 | 8.85 |
| 44449.9375 | 8.95 |
| 44449.947916666664 | 7.64 |
| 44449.958333333336 | 7.37 |
| 44449.96875 | 8.29 |
| 44449.979166666664 | 7.43 |
| 44449.989583333336 | 6.87 |
| 44450.0 | 6.88 |
| 44450.010416666664 | 6.75 |
| 44450.020833333336 | 6.31 |
| 44450.03125 | 6.15 |
| 44450.041666666664 | 5.79 |
| 44450.052083333336 | 5.77 |
| 44450.0625 | 5.75 |
| 44450.072916666664 | 5.39 |
| 44450.083333333336 | 5.37 |
| 44450.09375 | 5.59 |
| 44450.104166666664 | 5.53 |
| 44450.114583333336 | 5.28 |
| 44450.125 | 5.46 |
| 44450.135416666664 | 5.35 |
| 44450.145833333336 | 5.38 |
| 44450.15625 | 4.55 |
| 44450.166666666664 | 6.36 |
| 44450.177083333336 | 4.99 |
| 44450.1875 | 4.2 |
| 44450.197916666664 | 4.39 |
| 44450.208333333336 | 4.57 |
| 44450.21875 | 4.6 |
| 44450.229166666664 | 4.09 |
| 44450.239583333336 | 4.01 |
| 44450.25 | 4.2 |
| 44450.260416666664 | 4.71 |
| 44450.270833333336 | 4.49 |
| 44450.28125 | 3.81 |
| 44450.291666666664 | 4.09 |
| 44450.302083333336 | 4.26 |
| 44450.3125 | 5.38 |
| 44450.322916666664 | 4.75 |
| 44450.333333333336 | 4.27 |
| 44450.34375 | 4.96 |
| 44450.354166666664 | 5.14 |
| 44450.364583333336 | 5.55 |
| 44450.375 | 5.51 |
| 44450.385416666664 | 5.44 |
| 44450.395833333336 | 5.39 |
| 44450.40625 | 5.78 |
| 44450.416666666664 | 5.77 |
| 44450.427083333336 | 5.93 |
| 44450.4375 | 6.57 |
| 44450.447916666664 | 5.66 |
| 44450.458333333336 | 5.72 |
| 44450.46875 | 5.6 |
| 44450.479166666664 | 5.05 |
| 44450.489583333336 | 4.88 |
| 44450.5 | 4.87 |
| 44450.510416666664 | 5.33 |
| 44450.520833333336 | 5.27 |
| 44450.53125 | 4.95 |
| 44450.541666666664 | 5.03 |
| 44450.552083333336 | 5.03 |
| 44450.5625 | 5.05 |
| 44450.572916666664 | 4.8 |
| 44450.583333333336 | 4.82 |
| 44450.59375 | 4.76 |
| 44450.604166666664 | 5.34 |
| 44450.614583333336 | 4.95 |
| 44450.625 | 5.19 |
| 44450.635416666664 | 5.26 |
| 44450.645833333336 | 4.23 |
| 44450.65625 | 3.44 |
| 44450.666666666664 | 4.24 |
| 44450.677083333336 | 4.62 |
| 44450.6875 | 4.42 |
| 44450.697916666664 | 5 |
| 44450.708333333336 | 5.03 |
| 44450.71875 | 3.96 |
| 44450.729166666664 | 5.07 |
| 44450.739583333336 | 5.64 |
| 44450.75 | 5.92 |
| 44450.760416666664 | 5.7 |
| 44450.770833333336 | 5.6 |
| 44450.78125 | 5.99 |
| 44450.791666666664 | 5.88 |
| 44450.802083333336 | 6.49 |
| 44450.8125 | 6.57 |
| 44450.822916666664 | 6.9 |
| 44450.833333333336 | 6.42 |
| 44450.84375 | 7.29 |
| 44450.854166666664 | 7.46 |
| 44450.864583333336 | 8.45 |
| 44450.875 | 8.73 |
| 44450.885416666664 | 9.09 |
| 44450.895833333336 | 9.34 |
| 44450.90625 | 9.77 |
| 44450.916666666664 | 10.09 |
| 44450.927083333336 | 11 |
| 44450.9375 | 11.66 |
| 44450.947916666664 | 11.92 |
| 44450.958333333336 | 12.83 |
| 44450.96875 | 13.97 |
| 44450.979166666664 | 14.14 |
| 44450.989583333336 | 12.29 |
| 44451.0 | 11.3 |
| 44451.010416666664 | 10.11 |
| 44451.020833333336 | 9.21 |
| 44451.03125 | 9.02 |
| 44451.041666666664 | 8.63 |
| 44451.052083333336 | 8.2 |
| 44451.0625 | 8.33 |
| 44451.072916666664 | 7.71 |
| 44451.083333333336 | 8.05 |
| 44451.09375 | 8.16 |
| 44451.104166666664 | 7.85 |
| 44451.114583333336 | 7.33 |
| 44451.125 | 6.95 |
| 44451.135416666664 | 6.81 |
| 44451.145833333336 | 6.5 |
| 44451.15625 | 6.59 |
| 44451.166666666664 | 6.42 |
| 44451.177083333336 | 6.19 |
| 44451.1875 | 5.84 |
| 44451.197916666664 | 6.18 |
| 44451.208333333336 | 5.97 |
| 44451.21875 | 5.32 |
| 44451.229166666664 | 5.2 |
| 44451.239583333336 | 5.49 |
| 44451.25 | 4.83 |
| 44451.260416666664 | 4.79 |
| 44451.270833333336 | 4.75 |
| 44451.28125 | 4.84 |
| 44451.291666666664 | 5.78 |
| 44451.302083333336 | 4.87 |
| 44451.3125 | 5.14 |
| 44451.322916666664 | 5.51 |
| 44451.333333333336 | 5.62 |
| 44451.34375 | 5.83 |
| 44451.354166666664 | 5.63 |
| 44451.364583333336 | 6.08 |
| 44451.375 | 6.81 |
| 44451.385416666664 | 6.94 |
| 44451.395833333336 | 6.81 |
| 44451.40625 | 6.97 |
| 44451.416666666664 | 7.36 |
| 44451.427083333336 | 7.73 |
| 44451.4375 | 7.82 |
| 44451.447916666664 | 7.46 |
| 44451.458333333336 | 7 |
| 44451.46875 | 7.36 |
| 44451.479166666664 | 6.57 |
| 44451.489583333336 | 7.46 |
| 44451.5 | 6.69 |
| 44451.510416666664 | 6.54 |
| 44451.520833333336 | 6.45 |
| 44451.53125 | 6.9 |
| 44451.541666666664 | 6.99 |
| 44451.552083333336 | 6.9 |
| 44451.5625 | 6.85 |
| 44451.572916666664 | 6.59 |
| 44451.583333333336 | 6.61 |
| 44451.59375 | 6.72 |
| 44451.604166666664 | 6.39 |
| 44451.614583333336 | 6.39 |
| 44451.625 | 6.18 |
| 44451.635416666664 | 6.21 |
| 44451.645833333336 | 6.2 |
| 44451.65625 | 6.17 |
| 44451.666666666664 | 5.67 |
| 44451.677083333336 | 5.73 |
| 44451.6875 | 5.63 |
| 44451.697916666664 | 5.15 |
| 44451.708333333336 | 5.61 |
| 44451.71875 | 5.69 |
| 44451.729166666664 | 5.71 |
| 44451.739583333336 | 5.51 |
| 44451.75 | 5.93 |
| 44451.760416666664 | 6.21 |
| 44451.770833333336 | 6.06 |
| 44451.78125 | 5.77 |
| 44451.791666666664 | 5.93 |
| 44451.802083333336 | 6.5 |
| 44451.8125 | 7.35 |
| 44451.822916666664 | 6.35 |
| 44451.833333333336 | 6.5 |
| 44451.84375 | 6.4 |
| 44451.854166666664 | 6.88 |
| 44451.864583333336 | 7.52 |
| 44451.875 | 8.08 |
| 44451.885416666664 | 8.5 |
| 44451.895833333336 | 9.21 |
| 44451.90625 | 10.06 |
| 44451.916666666664 | 10.52 |
| 44451.927083333336 | 10.4 |
| 44451.9375 | 9.96 |
| 44451.947916666664 | 10.62 |
| 44451.958333333336 | 10.99 |
| 44451.96875 | 11.1 |
| 44451.979166666664 | 11.65 |
| 44451.989583333336 | 13.01 |
| 44452.0 | 14.46 |
| 44452.010416666664 | 13.81 |
| 44452.020833333336 | 11.06 |
| 44452.03125 | 11.01 |
| 44452.041666666664 | 9.84 |
| 44452.052083333336 | 9.89 |
| 44452.0625 | 8.22 |
| 44452.072916666664 | 8.87 |
| 44452.083333333336 | 8.95 |
| 44452.09375 | 8.41 |
| 44452.104166666664 | 7.89 |
| 44452.114583333336 | 7.76 |
| 44452.125 | 7.98 |
| 44452.135416666664 | 7.33 |
| 44452.145833333336 | 7 |
| 44452.15625 | 7.02 |
| 44452.166666666664 | 6.61 |
| 44452.177083333336 | 5.94 |
| 44452.1875 | 5.59 |
| 44452.197916666664 | 5.94 |
| 44452.208333333336 | 6.27 |
| 44452.21875 | 6.11 |
| 44452.229166666664 | 5.56 |
| 44452.239583333336 | 6.07 |
| 44452.25 | 5.46 |
| 44452.260416666664 | 5.22 |
| 44452.270833333336 | 5.41 |
| 44452.28125 | 5.51 |
| 44452.291666666664 | 4.97 |
| 44452.302083333336 | 4.89 |
| 44452.3125 | 5.1 |
| 44452.322916666664 | 5.02 |
| 44452.333333333336 | 4.91 |
| 44452.34375 | 5.26 |
| 44452.354166666664 | 5.28 |
| 44452.364583333336 | 5.67 |
| 44452.375 | 5.53 |
| 44452.385416666664 | 6.02 |
| 44452.395833333336 | 6.37 |
| 44452.40625 | 6.27 |
| 44452.416666666664 | 6.66 |
| 44452.427083333336 | 7.44 |
| 44452.4375 | 7.18 |
| 44452.447916666664 | 7.52 |
| 44452.458333333336 | 7.63 |
| 44452.46875 | 7.38 |
| 44452.479166666664 | 7.89 |
| 44452.489583333336 | 8.39 |
| 44452.5 | 8.33 |
| 44452.510416666664 | 7.16 |
| 44452.520833333336 | 7.55 |
| 44452.53125 | 7.48 |
| 44452.541666666664 | 6.83 |
| 44452.552083333336 | 6.75 |
| 44452.5625 | 6.48 |
| 44452.572916666664 | 6.42 |
| 44452.583333333336 | 4.41 |
| 44452.59375 | 6.91 |
| 44452.604166666664 | 6.61 |
| 44452.614583333336 | 6.07 |
| 44452.625 | 6.33 |
| 44452.635416666664 | 5.89 |
| 44452.645833333336 | 5.69 |
| 44452.65625 | 5.5 |
| 44452.666666666664 | 5.51 |
| 44452.677083333336 | 5.6 |
| 44452.6875 | 5.09 |
| 44452.697916666664 | 5.07 |
| 44452.708333333336 | 5.32 |
| 44452.71875 | 4.91 |
| 44452.729166666664 | 4.88 |
| 44452.739583333336 | 5.05 |
| 44452.75 | 6.44 |
| 44452.760416666664 | 4.91 |
| 44452.770833333336 | 4.75 |
| 44452.78125 | 5.51 |
| 44452.791666666664 | 5.96 |
| 44452.802083333336 | 5.85 |
| 44452.8125 | 5.83 |
| 44452.822916666664 | 5.18 |
| 44452.833333333336 | 5.09 |
| 44452.84375 | 5.76 |
| 44452.854166666664 | 6.13 |
| 44452.864583333336 | 6.61 |
| 44452.875 | 6.11 |
| 44452.885416666664 | 6.89 |
| 44452.895833333336 | 7.84 |
| 44452.90625 | 6.5 |
| 44452.916666666664 | 6.29 |
| 44452.927083333336 | 6.77 |
| 44452.9375 | 7.35 |
| 44452.947916666664 | 7.28 |
| 44452.958333333336 | 7.83 |
| 44452.96875 | 8.53 |
| 44452.979166666664 | 8.78 |
| 44452.989583333336 | 8.95 |
| 44453.0 | 8.46 |
| 44453.010416666664 | 8.66 |
| 44453.020833333336 | 11.93 |
| 44453.03125 | 8.81 |
| 44453.041666666664 | 8.35 |
| 44453.052083333336 | 10.79 |
| 44453.0625 | 8.8 |
| 44453.072916666664 | 8.23 |
| 44453.083333333336 | 7.84 |
| 44453.09375 | 7.11 |
| 44453.104166666664 | 6.73 |
| 44453.114583333336 | 7.26 |
| 44453.125 | 6.84 |
| 44453.135416666664 | 6.99 |
| 44453.145833333336 | 6.55 |
| 44453.15625 | 6.37 |
| 44453.166666666664 | 6.09 |
| 44453.177083333336 | 5.74 |
| 44453.1875 | 5.61 |
| 44453.197916666664 | 5.47 |
| 44453.208333333336 | 5.09 |
| 44453.21875 | 4.94 |
| 44453.229166666664 | 4.92 |
| 44453.239583333336 | 5 |
| 44453.25 | 5.27 |
| 44453.260416666664 | 4.87 |
| 44453.270833333336 | 4.98 |
| 44453.28125 | 4.84 |
| 44453.291666666664 | 4.39 |
| 44453.302083333336 | 3.83 |
| 44453.3125 | 3.51 |
| 44453.322916666664 | 3.96 |
| 44453.333333333336 | 4.36 |
| 44453.34375 | 4.51 |
| 44453.354166666664 | 3.86 |
| 44453.364583333336 | 4.34 |
| 44453.375 | 4.11 |
| 44453.385416666664 | 5.1 |
| 44453.395833333336 | 4.51 |
| 44453.40625 | 4.9 |
| 44453.416666666664 | 4.9 |
| 44453.427083333336 | 5.45 |
| 44453.4375 | 5.51 |
| 44453.447916666664 | 6.2 |
| 44453.458333333336 | 6.02 |
| 44453.46875 | 6.11 |
| 44453.479166666664 | 6.58 |
| 44453.489583333336 | 6.73 |
| 44453.5 | 7.58 |
| 44453.510416666664 | 7.93 |
| 44453.520833333336 | 8.18 |
| 44453.53125 | 9.84 |
| 44453.541666666664 | 9.6 |
| 44453.552083333336 | 8.71 |
| 44453.5625 | 9.9 |
| 44453.572916666664 | 9.26 |
| 44453.583333333336 | 8.04 |
| 44453.59375 | 7.71 |
| 44453.604166666664 | 7.55 |
| 44453.614583333336 | 7.4 |
| 44453.625 | 6.61 |
| 44453.635416666664 | 6.91 |
| 44453.645833333336 | 5.76 |
| 44453.65625 | 5.18 |
| 44453.666666666664 | 5.56 |
| 44453.677083333336 | 5.42 |
| 44453.6875 | 5.95 |
| 44453.697916666664 | 6.08 |
| 44453.708333333336 | 5.91 |
| 44453.71875 | 6.42 |
| 44453.729166666664 | 5.87 |
| 44453.739583333336 | 6.25 |
| 44453.75 | 6.77 |
| 44453.760416666664 | 5.85 |
| 44453.770833333336 | 6.15 |
| 44453.78125 | 6.76 |
| 44453.791666666664 | 6.83 |
| 44453.802083333336 | 7.12 |
| 44453.8125 | 6.23 |
| 44453.822916666664 | 5.87 |
| 44453.833333333336 | 6.68 |
| 44453.84375 | 6.63 |
| 44453.854166666664 | 6.47 |
| 44453.864583333336 | 6.44 |
| 44453.875 | 10.84 |
| 44453.885416666664 | 8.53 |
| 44453.895833333336 | 7.16 |
| 44453.90625 | 7.68 |
| 44453.916666666664 | 7.6 |
| 44453.927083333336 | 6.5 |
| 44453.9375 | 7.21 |
| 44453.947916666664 | 7.36 |
| 44453.958333333336 | 7.28 |
| 44453.96875 | 7.34 |
| 44453.979166666664 | 7.7 |
| 44453.989583333336 | 8.47 |
| 44454.0 | 8.12 |
| 44454.010416666664 | 8.22 |
| 44454.020833333336 | 9.14 |
| 44454.03125 | 9.11 |
| 44454.041666666664 | 8.85 |
| 44454.052083333336 | 9.1 |
| 44454.0625 | 9.44 |
| 44454.072916666664 | 9.66 |
| 44454.083333333336 | 9.79 |
| 44454.09375 | 10.05 |
| 44454.104166666664 | 8.66 |
| 44454.114583333336 | 8.13 |
| 44454.125 | 8.92 |
| 44454.135416666664 | 8.38 |
| 44454.145833333336 | 7.59 |
| 44454.15625 | 7.41 |
| 44454.166666666664 | 7.15 |
| 44454.177083333336 | 6.77 |
| 44454.1875 | 6.53 |
| 44454.197916666664 | 6.83 |
| 44454.208333333336 | 6.26 |
| 44454.21875 | 6.35 |
| 44454.229166666664 | 5.91 |
| 44454.239583333336 | 5.95 |
| 44454.25 | 6.07 |
| 44454.260416666664 | 6.27 |
| 44454.270833333336 | 5.97 |
| 44454.28125 | 5.93 |
| 44454.291666666664 | 6.03 |
| 44454.302083333336 | 5.52 |
| 44454.3125 | 5.72 |
| 44454.322916666664 | 5.42 |
| 44454.333333333336 | 5.53 |
| 44454.34375 | 5.32 |
| 44454.354166666664 | 4.86 |
| 44454.364583333336 | 4.57 |
| 44454.375 | 5.26 |
| 44454.385416666664 | 5.24 |
| 44454.395833333336 | 4.96 |
| 44454.40625 | 5.09 |
| 44454.416666666664 | 5.49 |
| 44454.427083333336 | 5.63 |
| 44454.4375 | 5.79 |
| 44454.447916666664 | 4.94 |
| 44454.458333333336 | 5.73 |
| 44454.46875 | 6.03 |
| 44454.479166666664 | 6.12 |
| 44454.489583333336 | 6.59 |
| 44454.5 | 6.95 |
| 44454.510416666664 | 7.51 |
| 44454.520833333336 | 7.68 |
| 44454.53125 | 8.54 |
| 44454.541666666664 | 9.33 |
| 44454.552083333336 | 9.63 |
| 44454.5625 | 9.48 |
| 44454.572916666664 | 9.69 |
| 44454.583333333336 | 9.91 |
| 44454.59375 | 11.14 |
| 44454.604166666664 | 12.31 |
| 44454.614583333336 | 12.53 |
| 44454.625 | 10.17 |
| 44454.635416666664 | 7.96 |
| 44454.645833333336 | 7.34 |
| 44454.65625 | 7.22 |
| 44454.666666666664 | 7.07 |
| 44454.677083333336 | 6.51 |
| 44454.6875 | 6.33 |
| 44454.697916666664 | 6.19 |
| 44454.708333333336 | 6.46 |
| 44454.71875 | 6.67 |
| 44454.729166666664 | 7.05 |
| 44454.739583333336 | 7.37 |
| 44454.75 | 7.24 |
| 44454.760416666664 | 7.35 |
| 44454.770833333336 | 7.34 |
| 44454.78125 | 7.25 |
| 44454.791666666664 | 7.13 |
| 44454.802083333336 | 7.02 |
| 44454.8125 | 7.12 |
| 44454.822916666664 | 6.65 |
| 44454.833333333336 | 7.1 |
| 44454.84375 | 7.38 |
| 44454.854166666664 | 6.76 |
| 44454.864583333336 | 6.91 |
| 44454.875 | 7.23 |
| 44454.885416666664 | 6.32 |
| 44454.895833333336 | 6.18 |
| 44454.90625 | 7.09 |
| 44454.916666666664 | 7.33 |
| 44454.927083333336 | 8.48 |
| 44454.9375 | 8.76 |
| 44454.947916666664 | 7.6 |
| 44454.958333333336 | 7.29 |
| 44454.96875 | 7.84 |
| 44454.979166666664 | 8.49 |
| 44454.989583333336 | 8.97 |
| 44455.0 | 8.74 |
| 44455.010416666664 | 8.93 |
| 44455.020833333336 | 8.87 |
| 44455.03125 | 8.85 |
| 44455.041666666664 | 9.2 |
| 44455.052083333336 | 9.1 |
| 44455.0625 | 9.18 |
| 44455.072916666664 | 8.3 |
| 44455.083333333336 | 9.18 |
| 44455.09375 | 9.25 |
| 44455.104166666664 | 9.07 |
| 44455.114583333336 | 9.46 |
| 44455.125 | 9.25 |
| 44455.135416666664 | 9.61 |
| 44455.145833333336 | 9.03 |
| 44455.15625 | 10.2 |
| 44455.166666666664 | 9.03 |
| 44455.177083333336 | 8.51 |
| 44455.1875 | 7.82 |
| 44455.197916666664 | 8.03 |
| 44455.208333333336 | 7.17 |
| 44455.21875 | 6.93 |
| 44455.229166666664 | 7.09 |
| 44455.239583333336 | 7.17 |
| 44455.25 | 5.47 |
| 44455.260416666664 | 6.73 |
| 44455.270833333336 | 6.71 |
| 44455.28125 | 6.8 |
| 44455.291666666664 | 7.1 |
| 44455.302083333336 | 7.93 |
| 44455.3125 | 6.65 |
| 44455.322916666664 | 6.55 |
| 44455.333333333336 | 6.96 |
| 44455.34375 | 7.02 |
| 44455.354166666664 | 10.44 |
| 44455.364583333336 | 6.29 |
| 44455.375 | 6.15 |
| 44455.385416666664 | 6.22 |
| 44455.395833333336 | 5.8 |
| 44455.40625 | 6.62 |
| 44455.416666666664 | 5.29 |
| 44455.427083333336 | 5.72 |
| 44455.4375 | 5.47 |
| 44455.447916666664 | 5.57 |
| 44455.458333333336 | 5.74 |
| 44455.46875 | 6.33 |
| 44455.479166666664 | 6.2 |
| 44455.489583333336 | 6.24 |
| 44455.5 | 6.6 |
| 44455.510416666664 | 7.28 |
| 44455.520833333336 | 7.69 |
| 44455.53125 | 8.08 |
| 44455.541666666664 | 8.46 |
| 44455.552083333336 | 9.28 |
| 44455.5625 | 9.41 |
| 44455.572916666664 | 9.62 |
| 44455.583333333336 | 9.9 |
| 44455.59375 | 10.48 |
| 44455.604166666664 | 10.63 |
| 44455.614583333336 | 10.73 |
| 44455.625 | 12.01 |
| 44455.635416666664 | 10.9 |
| 44455.645833333336 | 12.17 |
| 44455.65625 | 11.67 |
| 44455.666666666664 | 12.19 |
| 44455.677083333336 | 10.21 |
| 44455.6875 | 8.37 |
| 44455.697916666664 | 8.62 |
| 44455.708333333336 | 8.42 |
| 44455.71875 | 8.1 |
| 44455.729166666664 | 8.13 |
| 44455.739583333336 | 6.71 |
| 44455.75 | 7.88 |
| 44455.760416666664 | 7.38 |
| 44455.770833333336 | 7.68 |
| 44455.78125 | 6.68 |
| 44455.791666666664 | 7.17 |
| 44455.802083333336 | 7.79 |
| 44455.8125 | 7.16 |
| 44455.822916666664 | 8.55 |
| 44455.833333333336 | 6.49 |
| 44455.84375 | 7.82 |
| 44455.854166666664 | 7.11 |
| 44455.864583333336 | 7.39 |
| 44455.875 | 7.49 |
| 44455.885416666664 | 6.95 |
| 44455.895833333336 | 6.59 |
| 44455.90625 | 6.5 |
| 44455.916666666664 | 6.44 |
| 44455.927083333336 | 6.76 |
| 44455.9375 | 6.98 |
| 44455.947916666664 | 6.68 |
| 44455.958333333336 | 6.82 |
| 44455.96875 | 7.21 |
| 44455.979166666664 | 7.02 |
| 44455.989583333336 | 8.79 |
| 44456.0 | 8.29 |
| 44456.010416666664 | 9.19 |
| 44456.020833333336 | 8.62 |
| 44456.03125 | 8.56 |
| 44456.041666666664 | 8.49 |
| 44456.052083333336 | 7.71 |
| 44456.0625 | 8.1 |
| 44456.072916666664 | 8 |
| 44456.083333333336 | 8.28 |
| 44456.09375 | 8.08 |
| 44456.104166666664 | 8.4 |
| 44456.114583333336 | 8.2 |
| 44456.125 | 8.49 |
| 44456.135416666664 | 8.38 |
| 44456.145833333336 | 8.31 |
| 44456.15625 | 9.73 |
| 44456.166666666664 | 7.71 |
| 44456.177083333336 | 7.89 |
| 44456.1875 | 8.1 |
| 44456.197916666664 | 7.9 |
| 44456.208333333336 | 7.42 |
| 44456.21875 | 6.61 |
| 44456.229166666664 | 6.65 |
| 44456.239583333336 | 6.22 |
| 44456.25 | 6.87 |
| 44456.260416666664 | 6.79 |
| 44456.270833333336 | 6.33 |
| 44456.28125 | 5.72 |
| 44456.291666666664 | 6.09 |
| 44456.302083333336 | 6.04 |
| 44456.3125 | 6.29 |
| 44456.322916666664 | 5.89 |
| 44456.333333333336 | 5.77 |
| 44456.34375 | 5.92 |
| 44456.354166666664 | 5.66 |
| 44456.364583333336 | 5.79 |
| 44456.375 | 5.07 |
| 44456.385416666664 | 5.05 |
| 44456.395833333336 | 5.14 |
| 44456.40625 | 4.8 |
| 44456.416666666664 | 4.89 |
| 44456.427083333336 | 4.74 |
| 44456.4375 | 4.51 |
| 44456.447916666664 | 4.66 |
| 44456.458333333336 | 4.52 |
| 44456.46875 | 4.73 |
| 44456.479166666664 | 4.93 |
| 44456.489583333336 | 4.76 |
| 44456.5 | 4.86 |
| 44456.510416666664 | 3.91 |
| 44456.520833333336 | 5.24 |
| 44456.53125 | 5.31 |
| 44456.541666666664 | 5.5 |
| 44456.552083333336 | 5.67 |
| 44456.5625 | 5.83 |
| 44456.572916666664 | 5.69 |
| 44456.583333333336 | 5.82 |
| 44456.59375 | 6.08 |
| 44456.604166666664 | 7.28 |
| 44456.614583333336 | 7.92 |
| 44456.625 | 8.6 |
| 44456.635416666664 | 8.63 |
| 44456.645833333336 | 9.39 |
| 44456.65625 | 9.3 |
| 44456.666666666664 | 10.71 |
| 44456.677083333336 | 11.28 |
| 44456.6875 | 12.88 |
| 44456.697916666664 | 9.1 |
| 44456.708333333336 | 10.33 |
| 44456.71875 | 11.72 |
| 44456.729166666664 | 11.45 |
| 44456.739583333336 | 12.62 |
| 44456.75 | 10.35 |
| 44456.760416666664 | 10.22 |
| 44456.770833333336 | 9.64 |
| 44456.78125 | 9.53 |
| 44456.791666666664 | 5.75 |
| 44456.802083333336 | 8.33 |
| 44456.8125 | 7.93 |
| 44456.822916666664 | 8.29 |
| 44456.833333333336 | 7.39 |
| 44456.84375 | 7.87 |
| 44456.854166666664 | 7.25 |
| 44456.864583333336 | 7.34 |
| 44456.875 | 7.48 |
| 44456.885416666664 | 7.38 |
| 44456.895833333336 | 8 |
| 44456.90625 | 4.39 |
| 44456.916666666664 | 6.84 |
| 44456.927083333336 | 5.6 |
| 44456.9375 | 6.59 |
| 44456.947916666664 | 5.84 |
| 44456.958333333336 | 5.86 |
| 44456.96875 | 6.11 |
| 44456.979166666664 | 6.48 |
| 44456.989583333336 | 6.09 |
| 44457.0 | 6.18 |
| 44457.010416666664 | 6.47 |
| 44457.020833333336 | 6.14 |
| 44457.03125 | 7.2 |
| 44457.041666666664 | 7.38 |
| 44457.052083333336 | 6.45 |
| 44457.0625 | 6.66 |
| 44457.072916666664 | 7.4 |
| 44457.083333333336 | 7.2 |
| 44457.09375 | 7.42 |
| 44457.104166666664 | 7.03 |
| 44457.114583333336 | 5.95 |
| 44457.125 | 6.75 |
| 44457.135416666664 | 7.03 |
| 44457.145833333336 | 7.81 |
| 44457.15625 | 7.21 |
| 44457.166666666664 | 7.02 |
| 44457.177083333336 | 6.92 |
| 44457.1875 | 7.39 |
| 44457.197916666664 | 8.11 |
| 44457.208333333336 | 9.05 |
| 44457.21875 | 7.53 |
| 44457.229166666664 | 6.15 |
| 44457.239583333336 | 7.46 |
| 44457.25 | 7.34 |
| 44457.260416666664 | 6.48 |
| 44457.270833333336 | 10.54 |
| 44457.28125 | 6.62 |
| 44457.291666666664 | 6.81 |
| 44457.302083333336 | 6.14 |
| 44457.3125 | 5.83 |
| 44457.322916666664 | 6.19 |
| 44457.333333333336 | 5.53 |
| 44457.34375 | 5.32 |
| 44457.354166666664 | 5.53 |
| 44457.364583333336 | 5.13 |
| 44457.375 | 5.25 |
| 44457.385416666664 | 5.83 |
| 44457.395833333336 | 5.37 |
| 44457.40625 | 4.78 |
| 44457.416666666664 | 4.75 |
| 44457.427083333336 | 4.61 |
| 44457.4375 | 4.93 |
| 44457.447916666664 | 5.01 |
| 44457.458333333336 | 4.4 |
| 44457.46875 | 5.1 |
| 44457.479166666664 | 5.35 |
| 44457.489583333336 | 4.26 |
| 44457.5 | 4.49 |
| 44457.510416666664 | 4.87 |
| 44457.520833333336 | 4.52 |
| 44457.53125 | 4.86 |
| 44457.541666666664 | 4.87 |
| 44457.552083333336 | 5.5 |
| 44457.5625 | 5.32 |
| 44457.572916666664 | 21.62 |
| 44457.583333333336 | 5.63 |
| 44457.59375 | 5.16 |
| 44457.604166666664 | 6.08 |
| 44457.614583333336 | 5.88 |
| 44457.625 | 6.89 |
| 44457.635416666664 | 6.61 |
| 44457.645833333336 | 6.8 |
| 44457.65625 | 7.2 |
| 44457.666666666664 | 7.32 |
| 44457.677083333336 | 8.21 |
| 44457.6875 | 7.38 |
| 44457.697916666664 | 8.59 |
| 44457.708333333336 | 8.19 |
| 44457.71875 | 8.42 |
| 44457.729166666664 | 10 |
| 44457.739583333336 | 11.08 |
| 44457.75 | 9.64 |
| 44457.760416666664 | 9.94 |
| 44457.770833333336 | 8.28 |
| 44457.78125 | 8.44 |
| 44457.791666666664 | 7.63 |
| 44457.802083333336 | 7.29 |
| 44457.8125 | 7.53 |
| 44457.822916666664 | 7.05 |
| 44457.833333333336 | 5.97 |
| 44457.84375 | 6.84 |
| 44457.854166666664 | 6.33 |
| 44457.864583333336 | 5.6 |
| 44457.875 | 6.2 |
| 44457.885416666664 | 5.71 |
| 44457.895833333336 | 6.72 |
| 44457.90625 | 5.79 |
| 44457.916666666664 | 5.72 |
| 44457.927083333336 | 6.23 |
| 44457.9375 | 9.64 |
| 44457.947916666664 | 5.59 |
| 44457.958333333336 | 5.49 |
| 44457.96875 | 5.8 |
| 44457.979166666664 | 5.97 |
| 44457.989583333336 | 6.63 |
| 44458.0 | 6.5 |
| 44458.010416666664 | 6.98 |
| 44458.020833333336 | 6.04 |
| 44458.03125 | 5.91 |
| 44458.041666666664 | 5.78 |
| 44458.052083333336 | 5.43 |
| 44458.0625 | 5.69 |
| 44458.072916666664 | 6.09 |
| 44458.083333333336 | 6.1 |
| 44458.09375 | 5.73 |
| 44458.104166666664 | 6.19 |
| 44458.114583333336 | 5.28 |
| 44458.125 | 5.48 |
| 44458.135416666664 | 5.97 |
| 44458.145833333336 | 5.69 |
| 44458.15625 | 5.85 |
| 44458.166666666664 | 5.73 |
| 44458.177083333336 | 5.69 |
| 44458.1875 | 5.74 |
| 44458.197916666664 | 6.35 |
| 44458.208333333336 | 6.47 |
| 44458.21875 | 6.72 |
| 44458.229166666664 | 6.28 |
| 44458.239583333336 | 7.62 |
| 44458.25 | 6.52 |
| 44458.260416666664 | 6.16 |
| 44458.270833333336 | 7.02 |
| 44458.28125 | 6.06 |
| 44458.291666666664 | 5.93 |
| 44458.302083333336 | 6.06 |
| 44458.3125 | 5.64 |
| 44458.322916666664 | 5.91 |
| 44458.333333333336 | 5.59 |
| 44458.34375 | 5.49 |
| 44458.354166666664 | 5.5 |
| 44458.364583333336 | 17.39 |
| 44458.375 | 4.82 |
| 44458.385416666664 | 5.81 |
| 44458.395833333336 | 5.16 |
| 44458.40625 | 4.77 |
| 44458.416666666664 | 4.68 |
| 44458.427083333336 | 4.49 |
| 44458.4375 | 4.59 |
| 44458.447916666664 | 4.58 |
| 44458.458333333336 | 5.97 |
| 44458.46875 | 4.45 |
| 44458.479166666664 | 3.91 |
| 44458.489583333336 | 4.03 |
| 44458.5 | 3.66 |
| 44458.510416666664 | 3.81 |
| 44458.520833333336 | 3.76 |
| 44458.53125 | 3.14 |
| 44458.541666666664 | 3.95 |
| 44458.552083333336 | 4.19 |
| 44458.5625 | 5.23 |
| 44458.572916666664 | 4.73 |
| 44458.583333333336 | 5.1 |
| 44458.59375 | 5.13 |
| 44458.604166666664 | 5.47 |
| 44458.614583333336 | 5.41 |
| 44458.625 | 5.76 |
| 44458.635416666664 | 6.51 |
| 44458.645833333336 | 6.51 |
| 44458.65625 | 6.54 |
| 44458.666666666664 | 6.82 |
| 44458.677083333336 | 7.17 |
| 44458.6875 | 7.75 |
| 44458.697916666664 | 7.77 |
| 44458.708333333336 | 8.8 |
| 44458.71875 | 9.47 |
| 44458.729166666664 | 9.52 |
| 44458.739583333336 | 11.24 |
| 44458.75 | 11.76 |
| 44458.760416666664 | 11.39 |
| 44458.770833333336 | 13.76 |
| 44458.78125 | 18.08 |
| 44458.791666666664 | 14.05 |
| 44458.802083333336 | 13.6 |
| 44458.8125 | 13.17 |
| 44458.822916666664 | 11.75 |
| 44458.833333333336 | 10.65 |
| 44458.84375 | 10.24 |
| 44458.854166666664 | 9.14 |
| 44458.864583333336 | 7.66 |
| 44458.875 | 7.91 |
| 44458.885416666664 | 7.25 |
| 44458.895833333336 | 6.69 |
| 44458.90625 | 5.93 |
| 44458.916666666664 | 6.24 |
| 44458.927083333336 | 5.95 |
| 44458.9375 | 5.53 |
| 44458.947916666664 | 5.99 |
| 44458.958333333336 | 5.55 |
| 44458.96875 | 6.05 |
| 44458.979166666664 | 6.29 |
| 44458.989583333336 | 6.15 |
| 44459.0 | 7.21 |
| 44459.010416666664 | 6.62 |
| 44459.020833333336 | 6.9 |
| 44459.03125 | 6.5 |
| 44459.041666666664 | 5.62 |
| 44459.052083333336 | 5.08 |
| 44459.0625 | 5.45 |
| 44459.072916666664 | 6.14 |
| 44459.083333333336 | 6.39 |
| 44459.09375 | 6.11 |
| 44459.104166666664 | 6.98 |
| 44459.114583333336 | 6.25 |
| 44459.125 | 6.37 |
| 44459.135416666664 | 6.24 |
| 44459.145833333336 | 5.92 |
| 44459.15625 | 6.35 |
| 44459.166666666664 | 6.27 |
| 44459.177083333336 | 6.27 |
| 44459.1875 | 6.1 |
| 44459.197916666664 | 6.64 |
| 44459.208333333336 | 22.69 |
| 44459.21875 | 6.46 |
| 44459.229166666664 | 7.05 |
| 44459.239583333336 | 7.06 |
| 44459.25 | 6.77 |
| 44459.260416666664 | 7.11 |
| 44459.270833333336 | 6.46 |
| 44459.28125 | 6.58 |
| 44459.291666666664 | 6.69 |
| 44459.302083333336 | 6.65 |
| 44459.3125 | 6.85 |
| 44459.322916666664 | 6.38 |
| 44459.333333333336 | 6.35 |
| 44459.34375 | 6.72 |
| 44459.354166666664 | 6.25 |
| 44459.364583333336 | 6.05 |
| 44459.375 | 5.76 |
| 44459.385416666664 | 5.64 |
| 44459.395833333336 | 5.22 |
| 44459.40625 | 5.62 |
| 44459.416666666664 | 5.34 |
| 44459.427083333336 | 5.45 |
| 44459.4375 | 5.25 |
| 44459.447916666664 | 5.06 |
| 44459.458333333336 | 5.02 |
| 44459.46875 | 5.12 |
| 44459.479166666664 | 4.56 |
| 44459.489583333336 | 4.47 |
| 44459.5 | 4.08 |
| 44459.510416666664 | 4.53 |
| 44459.520833333336 | 4.56 |
| 44459.53125 | 4.91 |
| 44459.541666666664 | 4.43 |
| 44459.552083333336 | 5.65 |
| 44459.5625 | 4.91 |
| 44459.572916666664 | 5.61 |
| 44459.583333333336 | 5.83 |
| 44459.59375 | 5.54 |
| 44459.604166666664 | 5.88 |
| 44459.614583333336 | 5.89 |
| 44459.625 | 6.35 |
| 44459.635416666664 | 5.73 |
| 44459.645833333336 | 5.98 |
| 44459.65625 | 5.92 |
| 44459.666666666664 | 6.31 |
| 44459.677083333336 | 6.54 |
| 44459.6875 | 7.22 |
| 44459.697916666664 | 7.19 |
| 44459.708333333336 | 7.49 |
| 44459.71875 | 8.41 |
| 44459.729166666664 | 8.53 |
| 44459.739583333336 | 10.12 |
| 44459.75 | 10.38 |
| 44459.760416666664 | 11.72 |
| 44459.770833333336 | 12.06 |
| 44459.78125 | 13.59 |
| 44459.791666666664 | 14.31 |
| 44459.802083333336 | 15.03 |
| 44459.8125 | 13.15 |
| 44459.822916666664 | 12.8 |
| 44459.833333333336 | 13.62 |
| 44459.84375 | 16.46 |
| 44459.854166666664 | 13.76 |
| 44459.864583333336 | 12.84 |
| 44459.875 | 11.39 |
| 44459.885416666664 | 10.83 |
| 44459.895833333336 | 8.84 |
| 44459.90625 | 7.76 |
| 44459.916666666664 | 7.25 |
| 44459.927083333336 | 7.04 |
| 44459.9375 | 6.03 |
| 44459.947916666664 | 6.09 |
| 44459.958333333336 | 5.57 |
| 44459.96875 | 5.91 |
| 44459.979166666664 | 6.42 |
| 44459.989583333336 | 6.17 |
| 44460.0 | 6.5 |
| 44460.010416666664 | 6.89 |
| 44460.020833333336 | 6.5 |
| 44460.03125 | 6.84 |
| 44460.041666666664 | 5.78 |
| 44460.052083333336 | 7.04 |
| 44460.0625 | 7.19 |
| 44460.072916666664 | 4.94 |
| 44460.083333333336 | 6.71 |
| 44460.09375 | 6.03 |
| 44460.104166666664 | 6.54 |
| 44460.114583333336 | 6.4 |
| 44460.125 | 6.08 |
| 44460.135416666664 | 6.04 |
| 44460.145833333336 | 6.36 |
| 44460.15625 | 5.87 |
| 44460.166666666664 | 5.85 |
| 44460.177083333336 | 5.84 |
| 44460.1875 | 5.75 |
| 44460.197916666664 | 5.89 |
| 44460.208333333336 | 5.81 |
| 44460.21875 | 6.2 |
| 44460.229166666664 | 6.48 |
| 44460.239583333336 | 6.21 |
| 44460.25 | 6.86 |
| 44460.260416666664 | 6.93 |
| 44460.270833333336 | 6.85 |
| 44460.28125 | 6.95 |
| 44460.291666666664 | 6.91 |
| 44460.302083333336 | 6.76 |
| 44460.3125 | 6.88 |
| 44460.322916666664 | 6.74 |
| 44460.333333333336 | 6.55 |
| 44460.34375 | 6.14 |
| 44460.354166666664 | 5.97 |
| 44460.364583333336 | 6.08 |
| 44460.375 | 5.98 |
| 44460.385416666664 | 5.89 |
| 44460.395833333336 | 5.67 |
| 44460.40625 | 5.47 |
| 44460.416666666664 | 5.82 |
| 44460.427083333336 | 5.89 |
| 44460.4375 | 5.63 |
| 44460.447916666664 | 5.4 |
| 44460.458333333336 | 5.18 |
| 44460.46875 | 4.92 |
| 44460.479166666664 | 4.87 |
| 44460.489583333336 | 4.99 |
| 44460.5 | 4.94 |
| 44460.510416666664 | 4.92 |
| 44460.520833333336 | 4.95 |
| 44460.53125 | 4.9 |
| 44460.541666666664 | 6.3 |
| 44460.552083333336 | 6.22 |
| 44460.5625 | 6.23 |
| 44460.572916666664 | 6.14 |
| 44460.583333333336 | 5.88 |
| 44460.59375 | 5.96 |
| 44460.604166666664 | 5.87 |
| 44460.614583333336 | 6.35 |
| 44460.625 | 6.21 |
| 44460.635416666664 | 5.92 |
| 44460.645833333336 | 5.34 |
| 44460.65625 | 5.79 |
| 44460.666666666664 | 6.02 |
| 44460.677083333336 | 5.99 |
| 44460.6875 | 5.86 |
| 44460.697916666664 | 6.18 |
| 44460.708333333336 | 6.72 |
| 44460.71875 | 7.47 |
| 44460.729166666664 | 7.67 |
| 44460.739583333336 | 7.53 |
| 44460.75 | 7.57 |
| 44460.760416666664 | 8.67 |
| 44460.770833333336 | 8.7 |
| 44460.78125 | 9.51 |
| 44460.791666666664 | 10.14 |
| 44460.802083333336 | 11.1 |
| 44460.8125 | 11.15 |
| 44460.822916666664 | 11.92 |
| 44460.833333333336 | 13.24 |
| 44460.84375 | 13.12 |
| 44460.854166666664 | 11.99 |
| 44460.864583333336 | 11.74 |
| 44460.875 | 11.94 |
| 44460.885416666664 | 10.05 |
| 44460.895833333336 | 9.18 |
| 44460.90625 | 8.1 |
| 44460.916666666664 | 7.82 |
| 44460.927083333336 | 7.03 |
| 44460.9375 | 6.56 |
| 44460.947916666664 | 7.06 |
| 44460.958333333336 | 7.05 |
| 44460.96875 | 6.45 |
| 44460.979166666664 | 6.13 |
| 44460.989583333336 | 6.72 |
| 44461.0 | 6.46 |
| 44461.010416666664 | 7.1 |
| 44461.020833333336 | 6.3 |
| 44461.03125 | 6.38 |
| 44461.041666666664 | 5.94 |
| 44461.052083333336 | 9.1 |
| 44461.0625 | 5.97 |
| 44461.072916666664 | 5.46 |
| 44461.083333333336 | 5.75 |
| 44461.09375 | 5.45 |
| 44461.104166666664 | 5.77 |
| 44461.114583333336 | 5.22 |
| 44461.125 | 5.67 |
| 44461.135416666664 | 5.18 |
| 44461.145833333336 | 5.47 |
| 44461.15625 | 5.79 |
| 44461.166666666664 | 5.65 |
| 44461.177083333336 | 5.42 |
| 44461.1875 | 5.67 |
| 44461.197916666664 | 5.5 |
| 44461.208333333336 | 5.34 |
| 44461.21875 | 5.38 |
| 44461.229166666664 | 5.8 |
| 44461.239583333336 | 5.43 |
| 44461.25 | 5.67 |
| 44461.260416666664 | 5.81 |
| 44461.270833333336 | 6.42 |
| 44461.28125 | 6.3 |
| 44461.291666666664 | 6.41 |
| 44461.302083333336 | 6.15 |
| 44461.3125 | 6.25 |
| 44461.322916666664 | 6.54 |
| 44461.333333333336 | 6.67 |
| 44461.34375 | 6.6 |
| 44461.354166666664 | 6.27 |
| 44461.364583333336 | 5.9 |
| 44461.375 | 5.6 |
| 44461.385416666664 | 5.63 |
| 44461.395833333336 | 5.38 |
| 44461.40625 | 5.07 |
| 44461.416666666664 | 5.47 |
| 44461.427083333336 | 5.25 |
| 44461.4375 | 5.69 |
| 44461.447916666664 | 5.54 |
| 44461.458333333336 | 5.41 |
| 44461.46875 | 5.37 |
| 44461.479166666664 | 5.42 |
| 44461.489583333336 | 5.18 |
| 44461.5 | 5.35 |
| 44461.510416666664 | 5.41 |
| 44461.520833333336 | 5.07 |
| 44461.53125 | 5.26 |
| 44461.541666666664 | 5.21 |
| 44461.552083333336 | 5.56 |
| 44461.5625 | 5.64 |
| 44461.572916666664 | 5.96 |
| 44461.583333333336 | 6.01 |
| 44461.59375 | 9.36 |
| 44461.604166666664 | 9.44 |
| 44461.614583333336 | 10.1 |
| 44461.625 | 9.98 |
| 44461.635416666664 | 9.49 |
| 44461.645833333336 | 10.32 |
| 44461.65625 | 9.98 |
| 44461.666666666664 | 10.18 |
| 44461.677083333336 | 10.05 |
| 44461.6875 | 10.06 |
| 44461.697916666664 | 10.93 |
| 44461.708333333336 | 11.08 |
| 44461.71875 | 11.39 |
| 44461.729166666664 | 12.09 |
| 44461.739583333336 | 12.24 |
| 44461.75 | 12.33 |
| 44461.760416666664 | 12.76 |
| 44461.770833333336 | 12.83 |
| 44461.78125 | 13.84 |
| 44461.791666666664 | 15.57 |
| 44461.802083333336 | 16.24 |
| 44461.8125 | 16.4 |
| 44461.822916666664 | 17.29 |
| 44461.833333333336 | 16.45 |
| 44461.84375 | 17.48 |
| 44461.854166666664 | 16.34 |
| 44461.864583333336 | 16.3 |
| 44461.875 | 15.3 |
| 44461.885416666664 | 14.23 |
| 44461.895833333336 | 13.08 |
| 44461.90625 | 12.24 |
| 44461.916666666664 | 13.14 |
| 44461.927083333336 | 13.59 |
| 44461.9375 | 13.72 |
| 44461.947916666664 | 15.5 |
| 44461.958333333336 | 15.4 |
| 44461.96875 | 17.02 |
| 44461.979166666664 | 16.86 |
| 44461.989583333336 | 16.79 |
| 44462.0 | 16.85 |
| 44462.010416666664 | 16.4 |
| 44462.020833333336 | 15.93 |
| 44462.03125 | 17.35 |
| 44462.041666666664 | 14.57 |
| 44462.052083333336 | 14.51 |
| 44462.0625 | 13.79 |
| 44462.072916666664 | 12.75 |
| 44462.083333333336 | 12.73 |
| 44462.09375 | 12.12 |
| 44462.104166666664 | 11.67 |
| 44462.114583333336 | 12.48 |
| 44462.125 | 11.33 |
| 44462.135416666664 | 11.64 |
| 44462.145833333336 | 10.23 |
| 44462.15625 | 11.23 |
| 44462.166666666664 | 10.91 |
| 44462.177083333336 | 11.01 |
| 44462.1875 | 11.06 |
| 44462.197916666664 | 11.09 |
| 44462.208333333336 | 11.8 |
| 44462.21875 | 11.75 |
| 44462.229166666664 | 11.71 |
| 44462.239583333336 | 11.5 |
| 44462.25 | 11.91 |
| 44462.260416666664 | 11.66 |
| 44462.270833333336 | 11.49 |
| 44462.28125 | 12.06 |
| 44462.291666666664 | 12.52 |
| 44462.302083333336 | 12.25 |
| 44462.3125 | 11.81 |
| 44462.322916666664 | 11.79 |
| 44462.333333333336 | 11.66 |
| 44462.34375 | 11.41 |
| 44462.354166666664 | 11.5 |
| 44462.364583333336 | 11.09 |
| 44462.375 | 11.1 |
| 44462.385416666664 | 11.42 |
| 44462.395833333336 | 10.84 |
| 44462.40625 | 10.77 |
| 44462.416666666664 | 11.82 |
| 44462.427083333336 | 13.01 |
| 44462.4375 | 18.06 |
| 44462.447916666664 | 14.96 |
| 44462.458333333336 | 15.24 |
| 44462.46875 | 15.26 |
| 44462.479166666664 | 15.5 |
| 44462.489583333336 | 15.42 |
| 44462.5 | 15.46 |
| 44462.510416666664 | 15.09 |
| 44462.520833333336 | 14.39 |
| 44462.53125 | 14.62 |
| 44462.541666666664 | 14.74 |
| 44462.552083333336 | 14.15 |
| 44462.5625 | 13.89 |
| 44462.572916666664 | 13.26 |
| 44462.583333333336 | 13.59 |
| 44462.59375 | 13.44 |
| 44462.604166666664 | 13.23 |
| 44462.614583333336 | 13.11 |
| 44462.625 | 11.89 |
| 44462.635416666664 | 13.2 |
| 44462.645833333336 | 12.79 |
| 44462.65625 | 11.61 |
| 44462.666666666664 | 11.11 |
| 44462.677083333336 | 12.46 |
| 44462.6875 | 12.31 |
| 44462.697916666664 | 11.57 |
| 44462.708333333336 | 12.12 |
| 44462.71875 | 13.92 |
| 44462.729166666664 | 13.32 |
| 44462.739583333336 | 14.33 |
| 44462.75 | 13.54 |
| 44462.760416666664 | 15.54 |
| 44462.770833333336 | 14.25 |
| 44462.78125 | 15.4 |
| 44462.791666666664 | 15.3 |
| 44462.802083333336 | 16.02 |
| 44462.8125 | 17.24 |
| 44462.822916666664 | 15.41 |
| 44462.833333333336 | 15.63 |
| 44462.84375 | 15.09 |
| 44462.854166666664 | 15.78 |
| 44462.864583333336 | 14.65 |
| 44462.875 | 15.49 |
| 44462.885416666664 | 14.96 |
| 44462.895833333336 | 15.01 |
| 44462.90625 | 14.03 |
| 44462.916666666664 | 13.85 |
| 44462.927083333336 | 12.79 |
| 44462.9375 | 13.27 |
| 44462.947916666664 | 14.23 |
| 44462.958333333336 | 14.02 |
| 44462.96875 | 13.51 |
| 44462.979166666664 | 14.04 |
| 44462.989583333336 | 11.9 |
| 44463.0 | 12.77 |
| 44463.010416666664 | 12.18 |
| 44463.020833333336 | 12.01 |
| 44463.03125 | 11.61 |
| 44463.041666666664 | 12.21 |
| 44463.052083333336 | 12.21 |
| 44463.0625 | 11.59 |
| 44463.072916666664 | 12 |
| 44463.083333333336 | 11.97 |
| 44463.09375 | 11.5 |
| 44463.104166666664 | 10.64 |
| 44463.114583333336 | 29.51 |
| 44463.125 | 11.65 |
| 44463.135416666664 | 14.82 |
| 44463.145833333336 | 11.54 |
| 44463.15625 | 9.09 |
| 44463.166666666664 | 9.96 |
| 44463.177083333336 | 9.53 |
| 44463.1875 | 10.35 |
| 44463.197916666664 | 9.62 |
| 44463.208333333336 | 9.47 |
| 44463.21875 | 9.72 |
| 44463.229166666664 | 9.55 |
| 44463.239583333336 | 9.77 |
| 44463.25 | 9.91 |
| 44463.260416666664 | 10.59 |
| 44463.270833333336 | 9.92 |
| 44463.28125 | 10.13 |
| 44463.291666666664 | 10.05 |
| 44463.302083333336 | 9.84 |
| 44463.3125 | 10.18 |
| 44463.322916666664 | 10.7 |
| 44463.333333333336 | 10.2 |
| 44463.34375 | 10.2 |
| 44463.354166666664 | 10.1 |
| 44463.364583333336 | 10.47 |
| 44463.375 | 10.96 |
| 44463.385416666664 | 11.22 |
| 44463.395833333336 | 10.9 |
| 44463.40625 | 9.75 |
| 44463.416666666664 | 9.56 |
| 44463.427083333336 | 9.6 |
| 44463.4375 | 9.66 |
| 44463.447916666664 | 9.45 |
| 44463.458333333336 | 10.05 |
| 44463.46875 | 10.43 |
| 44463.479166666664 | 9.99 |
| 44463.489583333336 | 10.34 |
| 44463.5 | 10.56 |
| 44463.510416666664 | 9.53 |
| 44463.520833333336 | 11.17 |
| 44463.53125 | 11.2 |
| 44463.541666666664 | 11.21 |
| 44463.552083333336 | 11.51 |
| 44463.5625 | 10.72 |
| 44463.572916666664 | 11 |
| 44463.583333333336 | 10.43 |
| 44463.59375 | 9.69 |
| 44463.604166666664 | 10.44 |
| 44463.614583333336 | 9.45 |
| 44463.625 | 9.89 |
| 44463.635416666664 | 9.5 |
| 44463.645833333336 | 9.35 |
| 44463.65625 | 9.2 |
| 44463.666666666664 | 9 |
| 44463.677083333336 | 8.48 |
| 44463.6875 | 8.81 |
| 44463.697916666664 | 9.04 |
| 44463.708333333336 | 8.61 |
| 44463.71875 | 8.84 |
| 44463.729166666664 | 8.78 |
| 44463.739583333336 | 9.14 |
| 44463.75 | 10.09 |
| 44463.760416666664 | 9.06 |
| 44463.770833333336 | 9.76 |
| 44463.78125 | 9.81 |
| 44463.791666666664 | 10.03 |
| 44463.802083333336 | 10.03 |
| 44463.8125 | 9.94 |
| 44463.822916666664 | 10.76 |
| 44463.833333333336 | 11.22 |
| 44463.84375 | 11.21 |
| 44463.854166666664 | 11.06 |
| 44463.864583333336 | 10.75 |
| 44463.875 | 10.9 |
| 44463.885416666664 | 10.98 |
| 44463.895833333336 | 10.74 |
| 44463.90625 | 10.18 |
| 44463.916666666664 | 10.09 |
| 44463.927083333336 | 10.26 |
| 44463.9375 | 10.02 |
| 44463.947916666664 | 10.38 |
| 44463.958333333336 | 10.98 |
| 44463.96875 | 10.47 |
| 44463.979166666664 | 10.28 |
| 44463.989583333336 | 9.63 |
| 44464.0 | 9.76 |
| 44464.010416666664 | 9.39 |
| 44464.020833333336 | 8.93 |
| 44464.03125 | 9.08 |
| 44464.041666666664 | 8.88 |
| 44464.052083333336 | 9.07 |
| 44464.0625 | 9.21 |
| 44464.072916666664 | 9.05 |
| 44464.083333333336 | 9.24 |
| 44464.09375 | 8.98 |
| 44464.104166666664 | 9 |
| 44464.114583333336 | 9.11 |
| 44464.125 | 8.86 |
| 44464.135416666664 | 9.44 |
| 44464.145833333336 | 8.78 |
| 44464.15625 | 8.83 |
| 44464.166666666664 | 7.71 |
| 44464.177083333336 | 7.32 |
| 44464.1875 | 8.34 |
| 44464.197916666664 | 8.17 |
| 44464.208333333336 | 7.33 |
| 44464.21875 | 9.06 |
| 44464.229166666664 | 8.04 |
| 44464.239583333336 | 7.91 |
| 44464.25 | 8.27 |
| 44464.260416666664 | 8.36 |
| 44464.270833333336 | 8.7 |
| 44464.28125 | 9.01 |
| 44464.291666666664 | 8.73 |
| 44464.302083333336 | 8.39 |
| 44464.3125 | 9.36 |
| 44464.322916666664 | 9.17 |
| 44464.333333333336 | 9.58 |
| 44464.34375 | 9.28 |
| 44464.354166666664 | 9.36 |
| 44464.364583333336 | 8.93 |
| 44464.375 | 9.6 |
| 44464.385416666664 | 9.69 |
| 44464.395833333336 | 9.4 |
| 44464.40625 | 9.35 |
| 44464.416666666664 | 9.3 |
| 44464.427083333336 | 9.27 |
| 44464.4375 | 9.47 |
| 44464.447916666664 | 9.06 |
| 44464.458333333336 | 8.36 |
| 44464.46875 | 8.28 |
| 44464.479166666664 | 8.39 |
| 44464.489583333336 | 8.63 |
| 44464.5 | 8.8 |
| 44464.510416666664 | 8.69 |
| 44464.520833333336 | 9.22 |
| 44464.53125 | 9.07 |
| 44464.541666666664 | 9.02 |
| 44464.552083333336 | 9.29 |
| 44464.5625 | 8.57 |
| 44464.572916666664 | 8.68 |
| 44464.583333333336 | 8.37 |
| 44464.59375 | 8.77 |
| 44464.604166666664 | 8.64 |
| 44464.614583333336 | 8.25 |
| 44464.625 | 7.44 |
| 44464.635416666664 | 7.62 |
| 44464.645833333336 | 7.74 |
| 44464.65625 | 7.78 |
| 44464.666666666664 | 7.75 |
| 44464.677083333336 | 7.81 |
| 44464.6875 | 7.13 |
| 44464.697916666664 | 7.07 |
| 44464.708333333336 | 8.62 |
| 44464.71875 | 7.76 |
| 44464.729166666664 | 8.14 |
| 44464.739583333336 | 8.89 |
| 44464.75 | 8.62 |
| 44464.760416666664 | 9.16 |
| 44464.770833333336 | 9.05 |
| 44464.78125 | 8.79 |
| 44464.791666666664 | 9.46 |
| 44464.802083333336 | 9.08 |
| 44464.8125 | 9.16 |
| 44464.822916666664 | 9.14 |
| 44464.833333333336 | 9.7 |
| 44464.84375 | 10.28 |
| 44464.854166666664 | 10.35 |
| 44464.864583333336 | 10.31 |
| 44464.875 | 10.58 |
| 44464.885416666664 | 10.51 |
| 44464.895833333336 | 10.65 |
| 44464.90625 | 10.41 |
| 44464.916666666664 | 10.45 |
| 44464.927083333336 | 10.67 |
| 44464.9375 | 10.34 |
| 44464.947916666664 | 10.58 |
| 44464.958333333336 | 11 |
| 44464.96875 | 10.98 |
| 44464.979166666664 | 9.77 |
| 44464.989583333336 | 10.36 |
| 44465.0 | 9.88 |
| 44465.010416666664 | 10.29 |
| 44465.020833333336 | 10.06 |
| 44465.03125 | 9.69 |
| 44465.041666666664 | 9.22 |
| 44465.052083333336 | 8.16 |
| 44465.0625 | 8.59 |
| 44465.072916666664 | 8.85 |
| 44465.083333333336 | 8.62 |
| 44465.09375 | 8.73 |
| 44465.104166666664 | 8.65 |
| 44465.114583333336 | 9.57 |
| 44465.125 | 8.35 |
| 44465.135416666664 | 8.82 |
| 44465.145833333336 | 8.1 |
| 44465.15625 | 8.55 |
| 44465.166666666664 | 8.84 |
| 44465.177083333336 | 8.45 |
| 44465.1875 | 8.95 |
| 44465.197916666664 | 8.07 |
| 44465.208333333336 | 7.97 |
| 44465.21875 | 9.48 |
| 44465.229166666664 | 8.44 |
| 44465.239583333336 | 7.86 |
| 44465.25 | 7.58 |
| 44465.260416666664 | 9.33 |
| 44465.270833333336 | 8.87 |
| 44465.28125 | 8.56 |
| 44465.291666666664 | 8.62 |
| 44465.302083333336 | 8.17 |
| 44465.3125 | 8.71 |
| 44465.322916666664 | 9.09 |
| 44465.333333333336 | 8.76 |
| 44465.34375 | 8.87 |
| 44465.354166666664 | 9.53 |
| 44465.364583333336 | 8.97 |
| 44465.375 | 9.45 |
| 44465.385416666664 | 8.84 |
| 44465.395833333336 | 9.88 |
| 44465.40625 | 9.68 |
| 44465.416666666664 | 9.57 |
| 44465.427083333336 | 9.17 |
| 44465.4375 | 9.35 |
| 44465.447916666664 | 10.05 |
| 44465.458333333336 | 9.32 |
| 44465.46875 | 8.81 |
| 44465.479166666664 | 8.36 |
| 44465.489583333336 | 8.64 |
| 44465.5 | 8.16 |
| 44465.510416666664 | 8.02 |
| 44465.520833333336 | 8.85 |
| 44465.53125 | 8.84 |
| 44465.541666666664 | 8.79 |
| 44465.552083333336 | 8.65 |
| 44465.5625 | 8.24 |
| 44465.572916666664 | 8.39 |
| 44465.583333333336 | 8.46 |
| 44465.59375 | 8.36 |
| 44465.604166666664 | 8.14 |
| 44465.614583333336 | 8.24 |
| 44465.625 | 8.29 |
| 44465.635416666664 | 7.91 |
| 44465.645833333336 | 8.43 |
| 44465.65625 | 8.42 |
| 44465.666666666664 | 7.67 |
| 44465.677083333336 | 7.84 |
| 44465.6875 | 7.39 |
| 44465.697916666664 | 7.79 |
| 44465.708333333336 | 8.36 |
| 44465.71875 | 8.43 |
| 44465.729166666664 | 7.52 |
| 44465.739583333336 | 8.59 |
| 44465.75 | 8.17 |
| 44465.760416666664 | 7.89 |
| 44465.770833333336 | 8.12 |
| 44465.78125 | 7.82 |
| 44465.791666666664 | 8.56 |
| 44465.802083333336 | 8.45 |
| 44465.8125 | 8.38 |
| 44465.822916666664 | 8.8 |
| 44465.833333333336 | 8.67 |
| 44465.84375 | 9.08 |
| 44465.854166666664 | 9.32 |
| 44465.864583333336 | 10.09 |
| 44465.875 | 9.98 |
| 44465.885416666664 | 10.12 |
| 44465.895833333336 | 9.95 |
| 44465.90625 | 9.86 |
| 44465.916666666664 | 9.68 |
| 44465.927083333336 | 10.03 |
| 44465.9375 | 9.91 |
| 44465.947916666664 | 10.85 |
| 44465.958333333336 | 11.42 |
| 44465.96875 | 11.12 |
| 44465.979166666664 | 13.39 |
| 44465.989583333336 | 11.58 |
| 44466.0 | 9.1 |
| 44466.010416666664 | 11.27 |
| 44466.020833333336 | 11.17 |
| 44466.03125 | 11.4 |
| 44466.041666666664 | 9.49 |
| 44466.052083333336 | 9.86 |
| 44466.0625 | 9.96 |
| 44466.072916666664 | 9.51 |
| 44466.083333333336 | 9.37 |
| 44466.09375 | 9.36 |
| 44466.104166666664 | 8.82 |
| 44466.114583333336 | 8.88 |
| 44466.125 | 9.2 |
| 44466.135416666664 | 8.85 |
| 44466.145833333336 | 9.06 |
| 44466.15625 | 9.06 |
| 44466.166666666664 | 9.4 |
| 44466.177083333336 | 8.9 |
| 44466.1875 | 8.87 |
| 44466.197916666664 | 9.02 |
| 44466.208333333336 | 8.79 |
| 44466.21875 | 8.18 |
| 44466.229166666664 | 8.8 |
| 44466.239583333336 | 8.05 |
| 44466.25 | 8.26 |
| 44466.260416666664 | 7.68 |
| 44466.270833333336 | 7.91 |
| 44466.28125 | 7.64 |
| 44466.291666666664 | 7.79 |
| 44466.302083333336 | 8.04 |
| 44466.3125 | 8.82 |
| 44466.322916666664 | 8.53 |
| 44466.333333333336 | 9.02 |
| 44466.34375 | 8.71 |
| 44466.354166666664 | 8.88 |
| 44466.364583333336 | 8.96 |
| 44466.375 | 9.36 |
| 44466.385416666664 | 9.22 |
| 44466.395833333336 | 9.22 |
| 44466.40625 | 10.17 |
| 44466.416666666664 | 9.62 |
| 44466.427083333336 | 8.92 |
| 44466.4375 | 9.31 |
| 44466.447916666664 | 9.08 |
| 44466.458333333336 | 9.7 |
| 44466.46875 | 9.58 |
| 44466.479166666664 | 8.86 |
| 44466.489583333336 | 8.39 |
| 44466.5 | 8.65 |
| 44466.510416666664 | 9.66 |
| 44466.520833333336 | 9.5 |
| 44466.53125 | 8.91 |
| 44466.541666666664 | 8.84 |
| 44466.552083333336 | 8.68 |
| 44466.5625 | 8.58 |
| 44466.572916666664 | 8.12 |
| 44466.583333333336 | 8.7 |
| 44466.59375 | 7.92 |
| 44466.604166666664 | 7.75 |
| 44466.614583333336 | 8.29 |
| 44466.625 | 7.72 |
| 44466.635416666664 | 8.21 |
| 44466.645833333336 | 8.16 |
| 44466.65625 | 8.14 |
| 44466.666666666664 | 8.11 |
| 44466.677083333336 | 7.95 |
| 44466.6875 | 8.95 |
| 44466.697916666664 | 8.59 |
| 44466.708333333336 | 8.61 |
| 44466.71875 | 8.9 |
| 44466.729166666664 | 8.4 |
| 44466.739583333336 | 8.76 |
| 44466.75 | 8.62 |
| 44466.760416666664 | 8.97 |
| 44466.770833333336 | 9.27 |
| 44466.78125 | 9.63 |
| 44466.791666666664 | 9.73 |
| 44466.802083333336 | 9.44 |
| 44466.8125 | 10.16 |
| 44466.822916666664 | 10.59 |
| 44466.833333333336 | 9.87 |
| 44466.84375 | 9.61 |
| 44466.854166666664 | 9.55 |
| 44466.864583333336 | 10.67 |
| 44466.875 | 9.65 |
| 44466.885416666664 | 10.01 |
| 44466.895833333336 | 10.42 |
| 44466.90625 | 10.9 |
| 44466.916666666664 | 10.32 |
| 44466.927083333336 | 10.54 |
| 44466.9375 | 9.98 |
| 44466.947916666664 | 9.98 |
| 44466.958333333336 | 10.13 |
| 44466.96875 | 10.17 |
| 44466.979166666664 | 9.9 |
| 44466.989583333336 | 10.5 |
| 44467.0 | 11.09 |
| 44467.010416666664 | 12.12 |
| 44467.020833333336 | 12.05 |
| 44467.03125 | 12.05 |
| 44467.041666666664 | 9.97 |
| 44467.052083333336 | 10.74 |
| 44467.0625 | 9.57 |
| 44467.072916666664 | 9.93 |
| 44467.083333333336 | 9.48 |
| 44467.09375 | 9.29 |
| 44467.104166666664 | 9.64 |
| 44467.114583333336 | 9.39 |
| 44467.125 | 9.36 |
| 44467.135416666664 | 9.87 |
| 44467.145833333336 | 9.68 |
| 44467.15625 | 9.43 |
| 44467.166666666664 | 8.85 |
| 44467.177083333336 | 9.09 |
| 44467.1875 | 8.76 |
| 44467.197916666664 | 9.23 |
| 44467.208333333336 | 9.05 |
| 44467.21875 | 9.54 |
| 44467.229166666664 | 8.79 |
| 44467.239583333336 | 7.65 |
| 44467.25 | 7.78 |
| 44467.260416666664 | 7.99 |
| 44467.270833333336 | 8.06 |
| 44467.28125 | 7.65 |
| 44467.291666666664 | 7.48 |
| 44467.302083333336 | 8.25 |
| 44467.3125 | 8.21 |
| 44467.322916666664 | 8.43 |
| 44467.333333333336 | 8.76 |
| 44467.34375 | 8.41 |
| 44467.354166666664 | 8.55 |
| 44467.364583333336 | 7.94 |
| 44467.375 | 7.78 |
| 44467.385416666664 | 8.03 |
| 44467.395833333336 | 8.42 |
| 44467.40625 | 8.52 |
| 44467.416666666664 | 8.64 |
| 44467.427083333336 | 9.09 |
| 44467.4375 | 8.56 |
| 44467.447916666664 | 8.6 |
| 44467.458333333336 | 8.58 |
| 44467.46875 | 8.88 |
| 44467.479166666664 | 8.84 |
| 44467.489583333336 | 9.1 |
| 44467.5 | 9.41 |
| 44467.510416666664 | 9.81 |
| 44467.520833333336 | 10.06 |
| 44467.53125 | 9.79 |
| 44467.541666666664 | 9.27 |
| 44467.552083333336 | 9.16 |
| 44467.5625 | 8.69 |
| 44467.572916666664 | 8.42 |
| 44467.583333333336 | 8.47 |
| 44467.59375 | 8.39 |
| 44467.604166666664 | 8 |
| 44467.614583333336 | 8.1 |
| 44467.625 | 8.14 |
| 44467.635416666664 | 8.08 |
| 44467.645833333336 | 8.05 |
| 44467.65625 | 8.24 |
| 44467.666666666664 | 7.79 |
| 44467.677083333336 | 8.03 |
| 44467.6875 | 8.45 |
| 44467.697916666664 | 8.35 |
| 44467.708333333336 | 7.83 |
| 44467.71875 | 8.09 |
| 44467.729166666664 | 7.93 |
| 44467.739583333336 | 8.78 |
| 44467.75 | 9.01 |
| 44467.760416666664 | 9.88 |
| 44467.770833333336 | 11.9 |
| 44467.78125 | 9.57 |
| 44467.791666666664 | 10.01 |
| 44467.802083333336 | 9.53 |
| 44467.8125 | 9.99 |
| 44467.822916666664 | 8.96 |
| 44467.833333333336 | 9.56 |
| 44467.84375 | 11.24 |
| 44467.854166666664 | 13.74 |
| 44467.864583333336 | 10.73 |
| 44467.875 | 10.33 |
| 44467.885416666664 | 10.17 |
| 44467.895833333336 | 9.87 |
| 44467.90625 | 9.31 |
| 44467.916666666664 | 8.82 |
| 44467.927083333336 | 9.21 |
| 44467.9375 | 9.57 |
| 44467.947916666664 | 9.2 |
| 44467.958333333336 | 9.09 |
| 44467.96875 | 9.26 |
| 44467.979166666664 | 8.92 |
| 44467.989583333336 | 8.74 |
| 44468.0 | 8.69 |
| 44468.010416666664 | 9.1 |
| 44468.020833333336 | 8.8 |
| 44468.03125 | 8.77 |
| 44468.041666666664 | 9.18 |
| 44468.052083333336 | 10.45 |
| 44468.0625 | 9.44 |
| 44468.072916666664 | 9.33 |
| 44468.083333333336 | 9.36 |
| 44468.09375 | 9.17 |
| 44468.104166666664 | 7.96 |
| 44468.114583333336 | 7.95 |
| 44468.125 | 7.57 |
| 44468.135416666664 | 7.53 |
| 44468.145833333336 | 8.17 |
| 44468.15625 | 7.76 |
| 44468.166666666664 | 7.74 |
| 44468.177083333336 | 7.44 |
| 44468.1875 | 8.73 |
| 44468.197916666664 | 7.86 |
| 44468.208333333336 | 7.63 |
| 44468.21875 | 7.43 |
| 44468.229166666664 | 7.85 |
| 44468.239583333336 | 7.41 |
| 44468.25 | 8.34 |
| 44468.260416666664 | 8.14 |
| 44468.270833333336 | 7.27 |
| 44468.28125 | 6.57 |
| 44468.291666666664 | 6.84 |
| 44468.302083333336 | 6.98 |
| 44468.3125 | 7.03 |
| 44468.322916666664 | 6.56 |
| 44468.333333333336 | 6.64 |
| 44468.34375 | 6.64 |
| 44468.354166666664 | 6.55 |
| 44468.364583333336 | 6.99 |
| 44468.375 | 6.7 |
| 44468.385416666664 | 7.64 |
| 44468.395833333336 | 7.15 |
| 44468.40625 | 8.12 |
| 44468.416666666664 | 7.5 |
| 44468.427083333336 | 7.49 |
| 44468.4375 | 7.72 |
| 44468.447916666664 | 7.67 |
| 44468.458333333336 | 7.66 |
| 44468.46875 | 7.3 |
| 44468.479166666664 | 7.29 |
| 44468.489583333336 | 7.57 |
| 44468.5 | 7.82 |
| 44468.510416666664 | 8.15 |
| 44468.520833333336 | 8.47 |
| 44468.53125 | 8.95 |
| 44468.541666666664 | 9.17 |
| 44468.552083333336 | 10.32 |
| 44468.5625 | 8.53 |
| 44468.572916666664 | 8.84 |
| 44468.583333333336 | 8.51 |
| 44468.59375 | 7.45 |
| 44468.604166666664 | 7.76 |
| 44468.614583333336 | 7.28 |
| 44468.625 | 7.59 |
| 44468.635416666664 | 7.51 |
| 44468.645833333336 | 7.95 |
| 44468.65625 | 7.77 |
| 44468.666666666664 | 8.52 |
| 44468.677083333336 | 7.91 |
| 44468.6875 | 7.96 |
| 44468.697916666664 | 8.12 |
| 44468.708333333336 | 8.12 |
| 44468.71875 | 8.21 |
| 44468.729166666664 | 8.09 |
| 44468.739583333336 | 7.76 |
| 44468.75 | 7.97 |
| 44468.760416666664 | 8.69 |
| 44468.770833333336 | 7.53 |
| 44468.78125 | 7.66 |
| 44468.791666666664 | 8.54 |
| 44468.802083333336 | 7.06 |
| 44468.8125 | 7.86 |
| 44468.822916666664 | 7.37 |
| 44468.833333333336 | 7.84 |
| 44468.84375 | 8.27 |
| 44468.854166666664 | 7.9 |
| 44468.864583333336 | 7.49 |
| 44468.875 | 7.65 |
| 44468.885416666664 | 7.81 |
| 44468.895833333336 | 7.95 |
| 44468.90625 | 8.13 |
| 44468.916666666664 | 8.32 |
| 44468.927083333336 | 8.43 |
| 44468.9375 | 8.61 |
| 44468.947916666664 | 8.6 |
| 44468.958333333336 | 8.93 |
| 44468.96875 | 9.05 |
| 44468.979166666664 | 9.77 |
| 44468.989583333336 | 9.44 |
| 44469.0 | 9.25 |
| 44469.010416666664 | 9.43 |
| 44469.020833333336 | 9.18 |
| 44469.03125 | 8.64 |
| 44469.041666666664 | 8.68 |
| 44469.052083333336 | 8.68 |
| 44469.0625 | 9.38 |
| 44469.072916666664 | 9.85 |
| 44469.083333333336 | 10.26 |
| 44469.09375 | 25.71 |
| 44469.104166666664 | 10.39 |
| 44469.114583333336 | 9.56 |
| 44469.125 | 8.72 |
| 44469.135416666664 | 8.47 |
| 44469.145833333336 | 8.39 |
| 44469.15625 | 7.61 |
| 44469.166666666664 | 8.05 |
| 44469.177083333336 | 7.56 |
| 44469.1875 | 7.59 |
| 44469.197916666664 | 7.28 |
| 44469.208333333336 | 7.66 |
| 44469.21875 | 7.51 |
| 44469.229166666664 | 7.53 |
| 44469.239583333336 | 6.94 |
| 44469.25 | 7.81 |
| 44469.260416666664 | 7.07 |
| 44469.270833333336 | 7.4 |
| 44469.28125 | 7.11 |
| 44469.291666666664 | 7.09 |
| 44469.302083333336 | 7.01 |
| 44469.3125 | 7.45 |
| 44469.322916666664 | 6.52 |
| 44469.333333333336 | 7.33 |
| 44469.34375 | 6.97 |
| 44469.354166666664 | 6.41 |
| 44469.364583333336 | 6.76 |
| 44469.375 | 6.7 |
| 44469.385416666664 | 6.91 |
| 44469.395833333336 | 7.01 |
| 44469.40625 | 7.22 |
| 44469.416666666664 | 7.14 |
| 44469.427083333336 | 7.32 |
| 44469.4375 | 7.62 |
| 44469.447916666664 | 7.12 |
| 44469.458333333336 | 7.74 |
| 44469.46875 | 7.68 |
| 44469.479166666664 | 8.22 |
| 44469.489583333336 | 8.33 |
| 44469.5 | 8.66 |
| 44469.510416666664 | 8.62 |
| 44469.520833333336 | 9.5 |
| 44469.53125 | 9.37 |
| 44469.541666666664 | 9.98 |
| 44469.552083333336 | 9.58 |
| 44469.5625 | 9.5 |
| 44469.572916666664 | 9.47 |
| 44469.583333333336 | 9.1 |
| 44469.59375 | 7.75 |
| 44469.604166666664 | 7.8 |
| 44469.614583333336 | 8.5 |
| 44469.625 | 9.07 |
| 44469.635416666664 | 9.19 |
| 44469.645833333336 | 8.36 |
| 44469.65625 | 7.84 |
| 44469.666666666664 | 8.21 |
| 44469.677083333336 | 8.05 |
| 44469.6875 | 7.99 |
| 44469.697916666664 | 7.68 |
| 44469.708333333336 | 7.98 |
| 44469.71875 | 8.16 |
| 44469.729166666664 | 7.6 |
| 44469.739583333336 | 7.61 |
| 44469.75 | 7.56 |
| 44469.760416666664 | 7.89 |
| 44469.770833333336 | 8.17 |
| 44469.78125 | 8.54 |
| 44469.791666666664 | 8.52 |
| 44469.802083333336 | 8.03 |
| 44469.8125 | 8.54 |
| 44469.822916666664 | 8.59 |
| 44469.833333333336 | 8.85 |
| 44469.84375 | 7.77 |
| 44469.854166666664 | 8.01 |
| 44469.864583333336 | 8.32 |
| 44469.875 | 8.63 |
| 44469.885416666664 | 11.08 |
| 44469.895833333336 | 9.57 |
| 44469.90625 | 8.46 |
| 44469.916666666664 | 7.83 |
| 44469.927083333336 | 7.82 |
| 44469.9375 | 8.62 |
| 44469.947916666664 | 8.42 |
| 44469.958333333336 | 9.08 |
| 44469.96875 | 9.05 |
| 44469.979166666664 | 9.41 |
| 44469.989583333336 | 9.16 |
| 44470.0 | 8.54 |
| 44470.010416666664 | 8.57 |
| 44470.020833333336 | 8.39 |
| 44470.03125 | 8.03 |
| 44470.041666666664 | 8.9 |
| 44470.052083333336 | 8.63 |
| 44470.0625 | 9.24 |
| 44470.072916666664 | 8.89 |
| 44470.083333333336 | 8.85 |
| 44470.09375 | 9.64 |
| 44470.104166666664 | 9.13 |
| 44470.114583333336 | 10.21 |
| 44470.125 | 9.57 |
| 44470.135416666664 | 9.57 |
| 44470.145833333336 | 9.52 |
| 44470.15625 | 9.41 |